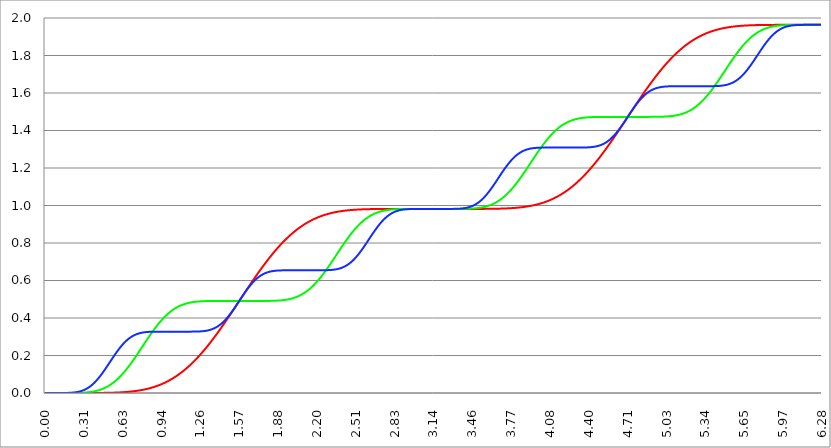
| Category | Series 1 | Series 0 | Series 2 |
|---|---|---|---|
| 0.0 | 0 | 0 | 0 |
| 0.00314159265358979 | 0 | 0 | 0 |
| 0.00628318530717958 | 0 | 0 | 0 |
| 0.00942477796076938 | 0 | 0 | 0 |
| 0.0125663706143592 | 0 | 0 | 0 |
| 0.015707963267949 | 0 | 0 | 0 |
| 0.0188495559215388 | 0 | 0 | 0 |
| 0.0219911485751285 | 0 | 0 | 0 |
| 0.0251327412287183 | 0 | 0 | 0 |
| 0.0282743338823081 | 0 | 0 | 0 |
| 0.0314159265358979 | 0 | 0 | 0 |
| 0.0345575191894877 | 0 | 0 | 0 |
| 0.0376991118430775 | 0 | 0 | 0 |
| 0.0408407044966673 | 0 | 0 | 0 |
| 0.0439822971502571 | 0 | 0 | 0 |
| 0.0471238898038469 | 0 | 0 | 0 |
| 0.0502654824574367 | 0 | 0 | 0 |
| 0.0534070751110265 | 0 | 0 | 0 |
| 0.0565486677646163 | 0 | 0 | 0 |
| 0.059690260418206 | 0 | 0 | 0 |
| 0.0628318530717958 | 0 | 0 | 0 |
| 0.0659734457253856 | 0 | 0 | 0 |
| 0.0691150383789754 | 0 | 0 | 0 |
| 0.0722566310325652 | 0 | 0 | 0 |
| 0.075398223686155 | 0 | 0 | 0 |
| 0.0785398163397448 | 0 | 0 | 0 |
| 0.0816814089933346 | 0 | 0 | 0 |
| 0.0848230016469244 | 0 | 0 | 0 |
| 0.0879645943005142 | 0 | 0 | 0 |
| 0.091106186954104 | 0 | 0 | 0 |
| 0.0942477796076937 | 0 | 0 | 0 |
| 0.0973893722612835 | 0 | 0 | 0 |
| 0.100530964914873 | 0 | 0 | 0 |
| 0.103672557568463 | 0 | 0 | 0 |
| 0.106814150222053 | 0 | 0 | 0 |
| 0.109955742875643 | 0 | 0 | 0 |
| 0.113097335529233 | 0 | 0 | 0 |
| 0.116238928182822 | 0 | 0 | 0 |
| 0.119380520836412 | 0 | 0 | 0 |
| 0.122522113490002 | 0 | 0 | 0 |
| 0.125663706143592 | 0 | 0 | 0 |
| 0.128805298797181 | 0 | 0 | 0 |
| 0.131946891450771 | 0 | 0 | 0 |
| 0.135088484104361 | 0 | 0 | 0 |
| 0.138230076757951 | 0 | 0 | 0 |
| 0.141371669411541 | 0 | 0 | 0 |
| 0.14451326206513 | 0 | 0 | 0 |
| 0.14765485471872 | 0 | 0 | 0 |
| 0.15079644737231 | 0 | 0 | 0 |
| 0.1539380400259 | 0 | 0 | 0 |
| 0.15707963267949 | 0 | 0 | 0 |
| 0.160221225333079 | 0 | 0 | 0 |
| 0.163362817986669 | 0 | 0 | 0 |
| 0.166504410640259 | 0 | 0 | 0 |
| 0.169646003293849 | 0 | 0 | 0 |
| 0.172787595947439 | 0 | 0 | 0 |
| 0.175929188601028 | 0 | 0 | 0 |
| 0.179070781254618 | 0 | 0 | 0 |
| 0.182212373908208 | 0 | 0 | 0.001 |
| 0.185353966561798 | 0 | 0 | 0.001 |
| 0.188495559215388 | 0 | 0 | 0.001 |
| 0.191637151868977 | 0 | 0 | 0.001 |
| 0.194778744522567 | 0 | 0 | 0.001 |
| 0.197920337176157 | 0 | 0 | 0.001 |
| 0.201061929829747 | 0 | 0 | 0.001 |
| 0.204203522483336 | 0 | 0 | 0.001 |
| 0.207345115136926 | 0 | 0 | 0.001 |
| 0.210486707790516 | 0 | 0 | 0.001 |
| 0.213628300444106 | 0 | 0 | 0.002 |
| 0.216769893097696 | 0 | 0 | 0.002 |
| 0.219911485751285 | 0 | 0 | 0.002 |
| 0.223053078404875 | 0 | 0 | 0.002 |
| 0.226194671058465 | 0 | 0 | 0.002 |
| 0.229336263712055 | 0 | 0 | 0.002 |
| 0.232477856365645 | 0 | 0 | 0.003 |
| 0.235619449019234 | 0 | 0 | 0.003 |
| 0.238761041672824 | 0 | 0 | 0.003 |
| 0.241902634326414 | 0 | 0 | 0.003 |
| 0.245044226980004 | 0 | 0 | 0.004 |
| 0.248185819633594 | 0 | 0 | 0.004 |
| 0.251327412287183 | 0 | 0 | 0.004 |
| 0.254469004940773 | 0 | 0.001 | 0.005 |
| 0.257610597594363 | 0 | 0.001 | 0.005 |
| 0.260752190247953 | 0 | 0.001 | 0.005 |
| 0.263893782901543 | 0 | 0.001 | 0.006 |
| 0.267035375555132 | 0 | 0.001 | 0.006 |
| 0.270176968208722 | 0 | 0.001 | 0.007 |
| 0.273318560862312 | 0 | 0.001 | 0.007 |
| 0.276460153515902 | 0 | 0.001 | 0.008 |
| 0.279601746169492 | 0 | 0.001 | 0.008 |
| 0.282743338823082 | 0 | 0.001 | 0.009 |
| 0.285884931476671 | 0 | 0.001 | 0.009 |
| 0.289026524130261 | 0 | 0.001 | 0.01 |
| 0.292168116783851 | 0 | 0.001 | 0.01 |
| 0.295309709437441 | 0 | 0.001 | 0.011 |
| 0.298451302091031 | 0 | 0.001 | 0.012 |
| 0.30159289474462 | 0 | 0.002 | 0.012 |
| 0.30473448739821 | 0 | 0.002 | 0.013 |
| 0.3078760800518 | 0 | 0.002 | 0.014 |
| 0.31101767270539 | 0 | 0.002 | 0.015 |
| 0.31415926535898 | 0 | 0.002 | 0.016 |
| 0.31730085801257 | 0 | 0.002 | 0.017 |
| 0.320442450666159 | 0 | 0.002 | 0.018 |
| 0.323584043319749 | 0 | 0.002 | 0.019 |
| 0.326725635973339 | 0 | 0.003 | 0.02 |
| 0.329867228626929 | 0 | 0.003 | 0.021 |
| 0.333008821280519 | 0 | 0.003 | 0.022 |
| 0.336150413934108 | 0 | 0.003 | 0.023 |
| 0.339292006587698 | 0 | 0.003 | 0.024 |
| 0.342433599241288 | 0 | 0.004 | 0.025 |
| 0.345575191894878 | 0 | 0.004 | 0.026 |
| 0.348716784548468 | 0 | 0.004 | 0.028 |
| 0.351858377202058 | 0 | 0.004 | 0.029 |
| 0.354999969855647 | 0 | 0.004 | 0.03 |
| 0.358141562509237 | 0 | 0.005 | 0.032 |
| 0.361283155162827 | 0 | 0.005 | 0.033 |
| 0.364424747816417 | 0 | 0.005 | 0.035 |
| 0.367566340470007 | 0 | 0.005 | 0.036 |
| 0.370707933123597 | 0 | 0.006 | 0.038 |
| 0.373849525777186 | 0 | 0.006 | 0.04 |
| 0.376991118430776 | 0 | 0.006 | 0.041 |
| 0.380132711084366 | 0 | 0.007 | 0.043 |
| 0.383274303737956 | 0 | 0.007 | 0.045 |
| 0.386415896391546 | 0 | 0.007 | 0.047 |
| 0.389557489045135 | 0 | 0.008 | 0.049 |
| 0.392699081698725 | 0 | 0.008 | 0.051 |
| 0.395840674352315 | 0 | 0.009 | 0.053 |
| 0.398982267005905 | 0 | 0.009 | 0.055 |
| 0.402123859659495 | 0 | 0.009 | 0.057 |
| 0.405265452313085 | 0 | 0.01 | 0.059 |
| 0.408407044966674 | 0 | 0.01 | 0.061 |
| 0.411548637620264 | 0 | 0.011 | 0.063 |
| 0.414690230273854 | 0 | 0.011 | 0.065 |
| 0.417831822927444 | 0 | 0.012 | 0.068 |
| 0.420973415581034 | 0 | 0.012 | 0.07 |
| 0.424115008234623 | 0 | 0.013 | 0.072 |
| 0.427256600888213 | 0 | 0.013 | 0.075 |
| 0.430398193541803 | 0 | 0.014 | 0.077 |
| 0.433539786195393 | 0 | 0.015 | 0.08 |
| 0.436681378848983 | 0 | 0.015 | 0.082 |
| 0.439822971502573 | 0 | 0.016 | 0.085 |
| 0.442964564156162 | 0 | 0.017 | 0.087 |
| 0.446106156809752 | 0 | 0.017 | 0.09 |
| 0.449247749463342 | 0 | 0.018 | 0.093 |
| 0.452389342116932 | 0 | 0.019 | 0.096 |
| 0.455530934770522 | 0 | 0.019 | 0.098 |
| 0.458672527424111 | 0.001 | 0.02 | 0.101 |
| 0.461814120077701 | 0.001 | 0.021 | 0.104 |
| 0.464955712731291 | 0.001 | 0.022 | 0.107 |
| 0.468097305384881 | 0.001 | 0.023 | 0.11 |
| 0.471238898038471 | 0.001 | 0.024 | 0.113 |
| 0.474380490692061 | 0.001 | 0.024 | 0.115 |
| 0.47752208334565 | 0.001 | 0.025 | 0.118 |
| 0.48066367599924 | 0.001 | 0.026 | 0.121 |
| 0.48380526865283 | 0.001 | 0.027 | 0.124 |
| 0.48694686130642 | 0.001 | 0.028 | 0.127 |
| 0.49008845396001 | 0.001 | 0.029 | 0.13 |
| 0.493230046613599 | 0.001 | 0.03 | 0.134 |
| 0.496371639267189 | 0.001 | 0.031 | 0.137 |
| 0.499513231920779 | 0.001 | 0.033 | 0.14 |
| 0.502654824574369 | 0.001 | 0.034 | 0.143 |
| 0.505796417227959 | 0.001 | 0.035 | 0.146 |
| 0.508938009881549 | 0.001 | 0.036 | 0.149 |
| 0.512079602535138 | 0.001 | 0.037 | 0.152 |
| 0.515221195188728 | 0.001 | 0.038 | 0.155 |
| 0.518362787842318 | 0.001 | 0.04 | 0.158 |
| 0.521504380495908 | 0.001 | 0.041 | 0.162 |
| 0.524645973149498 | 0.001 | 0.042 | 0.165 |
| 0.527787565803087 | 0.001 | 0.044 | 0.168 |
| 0.530929158456677 | 0.001 | 0.045 | 0.171 |
| 0.534070751110267 | 0.001 | 0.046 | 0.174 |
| 0.537212343763857 | 0.001 | 0.048 | 0.177 |
| 0.540353936417447 | 0.002 | 0.049 | 0.18 |
| 0.543495529071037 | 0.002 | 0.051 | 0.183 |
| 0.546637121724626 | 0.002 | 0.052 | 0.187 |
| 0.549778714378216 | 0.002 | 0.054 | 0.19 |
| 0.552920307031806 | 0.002 | 0.055 | 0.193 |
| 0.556061899685396 | 0.002 | 0.057 | 0.196 |
| 0.559203492338986 | 0.002 | 0.059 | 0.199 |
| 0.562345084992576 | 0.002 | 0.06 | 0.202 |
| 0.565486677646165 | 0.002 | 0.062 | 0.205 |
| 0.568628270299755 | 0.002 | 0.064 | 0.208 |
| 0.571769862953345 | 0.002 | 0.066 | 0.211 |
| 0.574911455606935 | 0.002 | 0.067 | 0.214 |
| 0.578053048260525 | 0.002 | 0.069 | 0.217 |
| 0.581194640914114 | 0.002 | 0.071 | 0.22 |
| 0.584336233567704 | 0.003 | 0.073 | 0.222 |
| 0.587477826221294 | 0.003 | 0.075 | 0.225 |
| 0.590619418874884 | 0.003 | 0.077 | 0.228 |
| 0.593761011528474 | 0.003 | 0.079 | 0.231 |
| 0.596902604182064 | 0.003 | 0.081 | 0.234 |
| 0.600044196835653 | 0.003 | 0.083 | 0.236 |
| 0.603185789489243 | 0.003 | 0.085 | 0.239 |
| 0.606327382142833 | 0.003 | 0.087 | 0.242 |
| 0.609468974796423 | 0.003 | 0.089 | 0.244 |
| 0.612610567450013 | 0.003 | 0.091 | 0.247 |
| 0.615752160103602 | 0.004 | 0.094 | 0.249 |
| 0.618893752757192 | 0.004 | 0.096 | 0.252 |
| 0.622035345410782 | 0.004 | 0.098 | 0.254 |
| 0.625176938064372 | 0.004 | 0.1 | 0.256 |
| 0.628318530717962 | 0.004 | 0.103 | 0.259 |
| 0.631460123371551 | 0.004 | 0.105 | 0.261 |
| 0.634601716025141 | 0.004 | 0.107 | 0.263 |
| 0.637743308678731 | 0.004 | 0.11 | 0.266 |
| 0.640884901332321 | 0.005 | 0.112 | 0.268 |
| 0.644026493985911 | 0.005 | 0.115 | 0.27 |
| 0.647168086639501 | 0.005 | 0.117 | 0.272 |
| 0.65030967929309 | 0.005 | 0.12 | 0.274 |
| 0.65345127194668 | 0.005 | 0.122 | 0.276 |
| 0.65659286460027 | 0.005 | 0.125 | 0.278 |
| 0.65973445725386 | 0.006 | 0.127 | 0.28 |
| 0.66287604990745 | 0.006 | 0.13 | 0.282 |
| 0.666017642561039 | 0.006 | 0.133 | 0.283 |
| 0.669159235214629 | 0.006 | 0.135 | 0.285 |
| 0.672300827868219 | 0.006 | 0.138 | 0.287 |
| 0.675442420521809 | 0.006 | 0.141 | 0.289 |
| 0.678584013175399 | 0.007 | 0.143 | 0.29 |
| 0.681725605828989 | 0.007 | 0.146 | 0.292 |
| 0.684867198482578 | 0.007 | 0.149 | 0.293 |
| 0.688008791136168 | 0.007 | 0.152 | 0.295 |
| 0.691150383789758 | 0.007 | 0.154 | 0.296 |
| 0.694291976443348 | 0.008 | 0.157 | 0.298 |
| 0.697433569096938 | 0.008 | 0.16 | 0.299 |
| 0.700575161750528 | 0.008 | 0.163 | 0.3 |
| 0.703716754404117 | 0.008 | 0.166 | 0.302 |
| 0.706858347057707 | 0.009 | 0.169 | 0.303 |
| 0.709999939711297 | 0.009 | 0.172 | 0.304 |
| 0.713141532364887 | 0.009 | 0.175 | 0.305 |
| 0.716283125018477 | 0.009 | 0.178 | 0.306 |
| 0.719424717672066 | 0.01 | 0.181 | 0.307 |
| 0.722566310325656 | 0.01 | 0.184 | 0.308 |
| 0.725707902979246 | 0.01 | 0.187 | 0.309 |
| 0.728849495632836 | 0.01 | 0.19 | 0.31 |
| 0.731991088286426 | 0.011 | 0.193 | 0.311 |
| 0.735132680940016 | 0.011 | 0.196 | 0.312 |
| 0.738274273593605 | 0.011 | 0.199 | 0.313 |
| 0.741415866247195 | 0.011 | 0.202 | 0.314 |
| 0.744557458900785 | 0.012 | 0.205 | 0.315 |
| 0.747699051554375 | 0.012 | 0.208 | 0.315 |
| 0.750840644207965 | 0.012 | 0.211 | 0.316 |
| 0.753982236861554 | 0.013 | 0.214 | 0.317 |
| 0.757123829515144 | 0.013 | 0.217 | 0.317 |
| 0.760265422168734 | 0.013 | 0.22 | 0.318 |
| 0.763407014822324 | 0.014 | 0.223 | 0.318 |
| 0.766548607475914 | 0.014 | 0.227 | 0.319 |
| 0.769690200129504 | 0.014 | 0.23 | 0.32 |
| 0.772831792783093 | 0.015 | 0.233 | 0.32 |
| 0.775973385436683 | 0.015 | 0.236 | 0.321 |
| 0.779114978090273 | 0.015 | 0.239 | 0.321 |
| 0.782256570743863 | 0.016 | 0.242 | 0.321 |
| 0.785398163397453 | 0.016 | 0.245 | 0.322 |
| 0.788539756051042 | 0.017 | 0.249 | 0.322 |
| 0.791681348704632 | 0.017 | 0.252 | 0.323 |
| 0.794822941358222 | 0.017 | 0.255 | 0.323 |
| 0.797964534011812 | 0.018 | 0.258 | 0.323 |
| 0.801106126665402 | 0.018 | 0.261 | 0.324 |
| 0.804247719318992 | 0.019 | 0.264 | 0.324 |
| 0.807389311972581 | 0.019 | 0.267 | 0.324 |
| 0.810530904626171 | 0.02 | 0.271 | 0.324 |
| 0.813672497279761 | 0.02 | 0.274 | 0.325 |
| 0.816814089933351 | 0.021 | 0.277 | 0.325 |
| 0.819955682586941 | 0.021 | 0.28 | 0.325 |
| 0.823097275240531 | 0.022 | 0.283 | 0.325 |
| 0.82623886789412 | 0.022 | 0.286 | 0.325 |
| 0.82938046054771 | 0.023 | 0.289 | 0.326 |
| 0.8325220532013 | 0.023 | 0.292 | 0.326 |
| 0.83566364585489 | 0.024 | 0.295 | 0.326 |
| 0.83880523850848 | 0.024 | 0.298 | 0.326 |
| 0.841946831162069 | 0.025 | 0.301 | 0.326 |
| 0.845088423815659 | 0.025 | 0.304 | 0.326 |
| 0.848230016469249 | 0.026 | 0.307 | 0.326 |
| 0.851371609122839 | 0.026 | 0.31 | 0.326 |
| 0.854513201776429 | 0.027 | 0.313 | 0.326 |
| 0.857654794430019 | 0.027 | 0.316 | 0.327 |
| 0.860796387083608 | 0.028 | 0.319 | 0.327 |
| 0.863937979737198 | 0.029 | 0.322 | 0.327 |
| 0.867079572390788 | 0.029 | 0.325 | 0.327 |
| 0.870221165044378 | 0.03 | 0.328 | 0.327 |
| 0.873362757697968 | 0.031 | 0.331 | 0.327 |
| 0.876504350351557 | 0.031 | 0.334 | 0.327 |
| 0.879645943005147 | 0.032 | 0.336 | 0.327 |
| 0.882787535658737 | 0.032 | 0.339 | 0.327 |
| 0.885929128312327 | 0.033 | 0.342 | 0.327 |
| 0.889070720965917 | 0.034 | 0.345 | 0.327 |
| 0.892212313619507 | 0.035 | 0.348 | 0.327 |
| 0.895353906273096 | 0.035 | 0.35 | 0.327 |
| 0.898495498926686 | 0.036 | 0.353 | 0.327 |
| 0.901637091580276 | 0.037 | 0.356 | 0.327 |
| 0.904778684233866 | 0.037 | 0.358 | 0.327 |
| 0.907920276887456 | 0.038 | 0.361 | 0.327 |
| 0.911061869541045 | 0.039 | 0.364 | 0.327 |
| 0.914203462194635 | 0.04 | 0.366 | 0.327 |
| 0.917345054848225 | 0.04 | 0.369 | 0.327 |
| 0.920486647501815 | 0.041 | 0.371 | 0.327 |
| 0.923628240155405 | 0.042 | 0.374 | 0.327 |
| 0.926769832808995 | 0.043 | 0.376 | 0.327 |
| 0.929911425462584 | 0.044 | 0.379 | 0.327 |
| 0.933053018116174 | 0.045 | 0.381 | 0.327 |
| 0.936194610769764 | 0.045 | 0.383 | 0.327 |
| 0.939336203423354 | 0.046 | 0.386 | 0.327 |
| 0.942477796076944 | 0.047 | 0.388 | 0.327 |
| 0.945619388730533 | 0.048 | 0.39 | 0.327 |
| 0.948760981384123 | 0.049 | 0.393 | 0.327 |
| 0.951902574037713 | 0.05 | 0.395 | 0.327 |
| 0.955044166691303 | 0.051 | 0.397 | 0.327 |
| 0.958185759344893 | 0.052 | 0.399 | 0.327 |
| 0.961327351998483 | 0.053 | 0.402 | 0.327 |
| 0.964468944652072 | 0.054 | 0.404 | 0.327 |
| 0.967610537305662 | 0.055 | 0.406 | 0.327 |
| 0.970752129959252 | 0.056 | 0.408 | 0.327 |
| 0.973893722612842 | 0.057 | 0.41 | 0.327 |
| 0.977035315266432 | 0.058 | 0.412 | 0.327 |
| 0.980176907920022 | 0.059 | 0.414 | 0.327 |
| 0.983318500573611 | 0.06 | 0.416 | 0.327 |
| 0.986460093227201 | 0.061 | 0.418 | 0.327 |
| 0.989601685880791 | 0.062 | 0.42 | 0.327 |
| 0.992743278534381 | 0.063 | 0.422 | 0.327 |
| 0.995884871187971 | 0.064 | 0.423 | 0.327 |
| 0.99902646384156 | 0.065 | 0.425 | 0.327 |
| 1.00216805649515 | 0.066 | 0.427 | 0.327 |
| 1.00530964914874 | 0.067 | 0.429 | 0.327 |
| 1.00845124180233 | 0.068 | 0.43 | 0.327 |
| 1.01159283445592 | 0.07 | 0.432 | 0.327 |
| 1.01473442710951 | 0.071 | 0.434 | 0.327 |
| 1.017876019763099 | 0.072 | 0.435 | 0.327 |
| 1.021017612416689 | 0.073 | 0.437 | 0.327 |
| 1.02415920507028 | 0.074 | 0.439 | 0.327 |
| 1.027300797723869 | 0.076 | 0.44 | 0.327 |
| 1.030442390377459 | 0.077 | 0.442 | 0.327 |
| 1.033583983031048 | 0.078 | 0.443 | 0.327 |
| 1.036725575684638 | 0.079 | 0.444 | 0.327 |
| 1.039867168338228 | 0.081 | 0.446 | 0.327 |
| 1.043008760991818 | 0.082 | 0.447 | 0.327 |
| 1.046150353645408 | 0.083 | 0.449 | 0.327 |
| 1.049291946298998 | 0.085 | 0.45 | 0.327 |
| 1.052433538952587 | 0.086 | 0.451 | 0.327 |
| 1.055575131606177 | 0.087 | 0.452 | 0.327 |
| 1.058716724259767 | 0.089 | 0.454 | 0.327 |
| 1.061858316913357 | 0.09 | 0.455 | 0.327 |
| 1.064999909566947 | 0.091 | 0.456 | 0.327 |
| 1.068141502220536 | 0.093 | 0.457 | 0.327 |
| 1.071283094874126 | 0.094 | 0.458 | 0.327 |
| 1.074424687527716 | 0.096 | 0.459 | 0.327 |
| 1.077566280181306 | 0.097 | 0.461 | 0.327 |
| 1.080707872834896 | 0.099 | 0.462 | 0.327 |
| 1.083849465488486 | 0.1 | 0.463 | 0.327 |
| 1.086991058142075 | 0.102 | 0.464 | 0.327 |
| 1.090132650795665 | 0.103 | 0.465 | 0.327 |
| 1.093274243449255 | 0.105 | 0.465 | 0.327 |
| 1.096415836102845 | 0.106 | 0.466 | 0.327 |
| 1.099557428756435 | 0.108 | 0.467 | 0.327 |
| 1.102699021410025 | 0.109 | 0.468 | 0.327 |
| 1.105840614063614 | 0.111 | 0.469 | 0.327 |
| 1.108982206717204 | 0.113 | 0.47 | 0.327 |
| 1.112123799370794 | 0.114 | 0.471 | 0.327 |
| 1.115265392024384 | 0.116 | 0.471 | 0.327 |
| 1.118406984677974 | 0.118 | 0.472 | 0.327 |
| 1.121548577331563 | 0.119 | 0.473 | 0.327 |
| 1.124690169985153 | 0.121 | 0.474 | 0.327 |
| 1.127831762638743 | 0.123 | 0.474 | 0.327 |
| 1.130973355292333 | 0.124 | 0.475 | 0.327 |
| 1.134114947945923 | 0.126 | 0.476 | 0.327 |
| 1.137256540599513 | 0.128 | 0.476 | 0.327 |
| 1.140398133253102 | 0.13 | 0.477 | 0.327 |
| 1.143539725906692 | 0.131 | 0.477 | 0.327 |
| 1.146681318560282 | 0.133 | 0.478 | 0.327 |
| 1.149822911213872 | 0.135 | 0.479 | 0.327 |
| 1.152964503867462 | 0.137 | 0.479 | 0.327 |
| 1.156106096521051 | 0.139 | 0.48 | 0.327 |
| 1.159247689174641 | 0.14 | 0.48 | 0.327 |
| 1.162389281828231 | 0.142 | 0.481 | 0.327 |
| 1.165530874481821 | 0.144 | 0.481 | 0.327 |
| 1.168672467135411 | 0.146 | 0.481 | 0.327 |
| 1.171814059789001 | 0.148 | 0.482 | 0.327 |
| 1.17495565244259 | 0.15 | 0.482 | 0.327 |
| 1.17809724509618 | 0.152 | 0.483 | 0.327 |
| 1.18123883774977 | 0.154 | 0.483 | 0.327 |
| 1.18438043040336 | 0.156 | 0.483 | 0.327 |
| 1.18752202305695 | 0.158 | 0.484 | 0.327 |
| 1.190663615710539 | 0.16 | 0.484 | 0.327 |
| 1.193805208364129 | 0.162 | 0.485 | 0.327 |
| 1.19694680101772 | 0.164 | 0.485 | 0.327 |
| 1.200088393671309 | 0.166 | 0.485 | 0.327 |
| 1.203229986324899 | 0.168 | 0.485 | 0.327 |
| 1.206371578978489 | 0.17 | 0.486 | 0.327 |
| 1.209513171632078 | 0.172 | 0.486 | 0.328 |
| 1.212654764285668 | 0.174 | 0.486 | 0.328 |
| 1.215796356939258 | 0.176 | 0.486 | 0.328 |
| 1.218937949592848 | 0.179 | 0.487 | 0.328 |
| 1.222079542246438 | 0.181 | 0.487 | 0.328 |
| 1.225221134900027 | 0.183 | 0.487 | 0.328 |
| 1.228362727553617 | 0.185 | 0.487 | 0.328 |
| 1.231504320207207 | 0.187 | 0.488 | 0.328 |
| 1.234645912860797 | 0.189 | 0.488 | 0.328 |
| 1.237787505514387 | 0.192 | 0.488 | 0.328 |
| 1.240929098167977 | 0.194 | 0.488 | 0.328 |
| 1.244070690821566 | 0.196 | 0.488 | 0.328 |
| 1.247212283475156 | 0.198 | 0.488 | 0.328 |
| 1.250353876128746 | 0.201 | 0.489 | 0.328 |
| 1.253495468782336 | 0.203 | 0.489 | 0.328 |
| 1.256637061435926 | 0.205 | 0.489 | 0.329 |
| 1.259778654089515 | 0.208 | 0.489 | 0.329 |
| 1.262920246743105 | 0.21 | 0.489 | 0.329 |
| 1.266061839396695 | 0.212 | 0.489 | 0.329 |
| 1.269203432050285 | 0.215 | 0.489 | 0.329 |
| 1.272345024703875 | 0.217 | 0.489 | 0.329 |
| 1.275486617357465 | 0.22 | 0.49 | 0.33 |
| 1.278628210011054 | 0.222 | 0.49 | 0.33 |
| 1.281769802664644 | 0.224 | 0.49 | 0.33 |
| 1.284911395318234 | 0.227 | 0.49 | 0.33 |
| 1.288052987971824 | 0.229 | 0.49 | 0.331 |
| 1.291194580625414 | 0.232 | 0.49 | 0.331 |
| 1.294336173279003 | 0.234 | 0.49 | 0.331 |
| 1.297477765932593 | 0.237 | 0.49 | 0.331 |
| 1.300619358586183 | 0.239 | 0.49 | 0.332 |
| 1.303760951239773 | 0.242 | 0.49 | 0.332 |
| 1.306902543893363 | 0.244 | 0.49 | 0.332 |
| 1.310044136546953 | 0.247 | 0.49 | 0.333 |
| 1.313185729200542 | 0.249 | 0.49 | 0.333 |
| 1.316327321854132 | 0.252 | 0.49 | 0.334 |
| 1.319468914507722 | 0.255 | 0.49 | 0.334 |
| 1.322610507161312 | 0.257 | 0.49 | 0.335 |
| 1.325752099814902 | 0.26 | 0.49 | 0.335 |
| 1.328893692468491 | 0.262 | 0.491 | 0.336 |
| 1.332035285122081 | 0.265 | 0.491 | 0.336 |
| 1.335176877775671 | 0.268 | 0.491 | 0.337 |
| 1.338318470429261 | 0.27 | 0.491 | 0.337 |
| 1.341460063082851 | 0.273 | 0.491 | 0.338 |
| 1.344601655736441 | 0.276 | 0.491 | 0.339 |
| 1.34774324839003 | 0.278 | 0.491 | 0.339 |
| 1.35088484104362 | 0.281 | 0.491 | 0.34 |
| 1.35402643369721 | 0.284 | 0.491 | 0.341 |
| 1.3571680263508 | 0.287 | 0.491 | 0.342 |
| 1.36030961900439 | 0.289 | 0.491 | 0.343 |
| 1.363451211657979 | 0.292 | 0.491 | 0.344 |
| 1.36659280431157 | 0.295 | 0.491 | 0.344 |
| 1.369734396965159 | 0.298 | 0.491 | 0.345 |
| 1.372875989618749 | 0.3 | 0.491 | 0.346 |
| 1.376017582272339 | 0.303 | 0.491 | 0.347 |
| 1.379159174925929 | 0.306 | 0.491 | 0.349 |
| 1.382300767579518 | 0.309 | 0.491 | 0.35 |
| 1.385442360233108 | 0.312 | 0.491 | 0.351 |
| 1.388583952886698 | 0.315 | 0.491 | 0.352 |
| 1.391725545540288 | 0.317 | 0.491 | 0.353 |
| 1.394867138193878 | 0.32 | 0.491 | 0.355 |
| 1.398008730847468 | 0.323 | 0.491 | 0.356 |
| 1.401150323501057 | 0.326 | 0.491 | 0.357 |
| 1.404291916154647 | 0.329 | 0.491 | 0.359 |
| 1.407433508808237 | 0.332 | 0.491 | 0.36 |
| 1.410575101461827 | 0.335 | 0.491 | 0.362 |
| 1.413716694115417 | 0.338 | 0.491 | 0.363 |
| 1.416858286769006 | 0.341 | 0.491 | 0.365 |
| 1.419999879422596 | 0.343 | 0.491 | 0.366 |
| 1.423141472076186 | 0.346 | 0.491 | 0.368 |
| 1.426283064729776 | 0.349 | 0.491 | 0.37 |
| 1.429424657383366 | 0.352 | 0.491 | 0.372 |
| 1.432566250036956 | 0.355 | 0.491 | 0.373 |
| 1.435707842690545 | 0.358 | 0.491 | 0.375 |
| 1.438849435344135 | 0.361 | 0.491 | 0.377 |
| 1.441991027997725 | 0.364 | 0.491 | 0.379 |
| 1.445132620651315 | 0.367 | 0.491 | 0.381 |
| 1.448274213304905 | 0.37 | 0.491 | 0.383 |
| 1.451415805958494 | 0.373 | 0.491 | 0.385 |
| 1.454557398612084 | 0.376 | 0.491 | 0.387 |
| 1.457698991265674 | 0.379 | 0.491 | 0.39 |
| 1.460840583919264 | 0.382 | 0.491 | 0.392 |
| 1.463982176572854 | 0.385 | 0.491 | 0.394 |
| 1.467123769226444 | 0.388 | 0.491 | 0.396 |
| 1.470265361880033 | 0.391 | 0.491 | 0.399 |
| 1.473406954533623 | 0.394 | 0.491 | 0.401 |
| 1.476548547187213 | 0.397 | 0.491 | 0.404 |
| 1.479690139840803 | 0.401 | 0.491 | 0.406 |
| 1.482831732494393 | 0.404 | 0.491 | 0.409 |
| 1.485973325147982 | 0.407 | 0.491 | 0.411 |
| 1.489114917801572 | 0.41 | 0.491 | 0.414 |
| 1.492256510455162 | 0.413 | 0.491 | 0.417 |
| 1.495398103108752 | 0.416 | 0.491 | 0.419 |
| 1.498539695762342 | 0.419 | 0.491 | 0.422 |
| 1.501681288415932 | 0.422 | 0.491 | 0.425 |
| 1.504822881069521 | 0.425 | 0.491 | 0.427 |
| 1.507964473723111 | 0.428 | 0.491 | 0.43 |
| 1.511106066376701 | 0.431 | 0.491 | 0.433 |
| 1.514247659030291 | 0.435 | 0.491 | 0.436 |
| 1.517389251683881 | 0.438 | 0.491 | 0.439 |
| 1.520530844337471 | 0.441 | 0.491 | 0.442 |
| 1.52367243699106 | 0.444 | 0.491 | 0.445 |
| 1.52681402964465 | 0.447 | 0.491 | 0.448 |
| 1.52995562229824 | 0.45 | 0.491 | 0.451 |
| 1.53309721495183 | 0.453 | 0.491 | 0.454 |
| 1.53623880760542 | 0.456 | 0.491 | 0.457 |
| 1.539380400259009 | 0.459 | 0.491 | 0.46 |
| 1.542521992912599 | 0.463 | 0.491 | 0.463 |
| 1.545663585566189 | 0.466 | 0.491 | 0.466 |
| 1.548805178219779 | 0.469 | 0.491 | 0.469 |
| 1.551946770873369 | 0.472 | 0.491 | 0.472 |
| 1.555088363526959 | 0.475 | 0.491 | 0.475 |
| 1.558229956180548 | 0.478 | 0.491 | 0.478 |
| 1.561371548834138 | 0.481 | 0.491 | 0.481 |
| 1.564513141487728 | 0.485 | 0.491 | 0.485 |
| 1.567654734141318 | 0.488 | 0.491 | 0.488 |
| 1.570796326794908 | 0.491 | 0.491 | 0.491 |
| 1.573937919448497 | 0.494 | 0.491 | 0.494 |
| 1.577079512102087 | 0.497 | 0.491 | 0.497 |
| 1.580221104755677 | 0.5 | 0.491 | 0.5 |
| 1.583362697409267 | 0.503 | 0.491 | 0.503 |
| 1.586504290062857 | 0.507 | 0.491 | 0.507 |
| 1.589645882716447 | 0.51 | 0.491 | 0.51 |
| 1.592787475370036 | 0.513 | 0.491 | 0.513 |
| 1.595929068023626 | 0.516 | 0.491 | 0.516 |
| 1.599070660677216 | 0.519 | 0.491 | 0.519 |
| 1.602212253330806 | 0.522 | 0.491 | 0.522 |
| 1.605353845984396 | 0.525 | 0.491 | 0.525 |
| 1.608495438637985 | 0.529 | 0.491 | 0.528 |
| 1.611637031291575 | 0.532 | 0.491 | 0.531 |
| 1.614778623945165 | 0.535 | 0.491 | 0.534 |
| 1.617920216598755 | 0.538 | 0.491 | 0.537 |
| 1.621061809252345 | 0.541 | 0.491 | 0.54 |
| 1.624203401905935 | 0.544 | 0.491 | 0.543 |
| 1.627344994559524 | 0.547 | 0.491 | 0.546 |
| 1.630486587213114 | 0.55 | 0.491 | 0.549 |
| 1.633628179866704 | 0.553 | 0.491 | 0.552 |
| 1.636769772520294 | 0.557 | 0.491 | 0.554 |
| 1.639911365173884 | 0.56 | 0.491 | 0.557 |
| 1.643052957827473 | 0.563 | 0.491 | 0.56 |
| 1.646194550481063 | 0.566 | 0.491 | 0.563 |
| 1.649336143134653 | 0.569 | 0.491 | 0.565 |
| 1.652477735788243 | 0.572 | 0.491 | 0.568 |
| 1.655619328441833 | 0.575 | 0.491 | 0.57 |
| 1.658760921095423 | 0.578 | 0.491 | 0.573 |
| 1.661902513749012 | 0.581 | 0.491 | 0.576 |
| 1.665044106402602 | 0.584 | 0.491 | 0.578 |
| 1.668185699056192 | 0.587 | 0.491 | 0.58 |
| 1.671327291709782 | 0.59 | 0.491 | 0.583 |
| 1.674468884363372 | 0.593 | 0.491 | 0.585 |
| 1.677610477016961 | 0.596 | 0.491 | 0.588 |
| 1.680752069670551 | 0.6 | 0.491 | 0.59 |
| 1.683893662324141 | 0.603 | 0.491 | 0.592 |
| 1.687035254977731 | 0.606 | 0.491 | 0.594 |
| 1.690176847631321 | 0.609 | 0.491 | 0.596 |
| 1.693318440284911 | 0.612 | 0.491 | 0.599 |
| 1.6964600329385 | 0.615 | 0.491 | 0.601 |
| 1.69960162559209 | 0.618 | 0.491 | 0.603 |
| 1.70274321824568 | 0.621 | 0.491 | 0.605 |
| 1.70588481089927 | 0.624 | 0.491 | 0.606 |
| 1.70902640355286 | 0.627 | 0.491 | 0.608 |
| 1.712167996206449 | 0.629 | 0.491 | 0.61 |
| 1.715309588860039 | 0.632 | 0.491 | 0.612 |
| 1.71845118151363 | 0.635 | 0.491 | 0.614 |
| 1.721592774167219 | 0.638 | 0.491 | 0.615 |
| 1.724734366820809 | 0.641 | 0.491 | 0.617 |
| 1.727875959474399 | 0.644 | 0.491 | 0.619 |
| 1.731017552127988 | 0.647 | 0.491 | 0.62 |
| 1.734159144781578 | 0.65 | 0.491 | 0.622 |
| 1.737300737435168 | 0.653 | 0.491 | 0.623 |
| 1.740442330088758 | 0.656 | 0.491 | 0.624 |
| 1.743583922742348 | 0.659 | 0.491 | 0.626 |
| 1.746725515395937 | 0.661 | 0.491 | 0.627 |
| 1.749867108049527 | 0.664 | 0.491 | 0.628 |
| 1.753008700703117 | 0.667 | 0.491 | 0.63 |
| 1.756150293356707 | 0.67 | 0.491 | 0.631 |
| 1.759291886010297 | 0.673 | 0.491 | 0.632 |
| 1.762433478663887 | 0.676 | 0.491 | 0.633 |
| 1.765575071317476 | 0.678 | 0.491 | 0.634 |
| 1.768716663971066 | 0.681 | 0.491 | 0.635 |
| 1.771858256624656 | 0.684 | 0.491 | 0.636 |
| 1.774999849278246 | 0.687 | 0.491 | 0.637 |
| 1.778141441931836 | 0.69 | 0.491 | 0.638 |
| 1.781283034585426 | 0.692 | 0.491 | 0.639 |
| 1.784424627239015 | 0.695 | 0.491 | 0.64 |
| 1.787566219892605 | 0.698 | 0.491 | 0.641 |
| 1.790707812546195 | 0.701 | 0.491 | 0.642 |
| 1.793849405199785 | 0.703 | 0.491 | 0.642 |
| 1.796990997853375 | 0.706 | 0.491 | 0.643 |
| 1.800132590506964 | 0.709 | 0.491 | 0.644 |
| 1.803274183160554 | 0.711 | 0.491 | 0.644 |
| 1.806415775814144 | 0.714 | 0.491 | 0.645 |
| 1.809557368467734 | 0.717 | 0.491 | 0.646 |
| 1.812698961121324 | 0.719 | 0.491 | 0.646 |
| 1.815840553774914 | 0.722 | 0.491 | 0.647 |
| 1.818982146428503 | 0.725 | 0.491 | 0.647 |
| 1.822123739082093 | 0.727 | 0.491 | 0.648 |
| 1.825265331735683 | 0.73 | 0.491 | 0.648 |
| 1.828406924389273 | 0.732 | 0.491 | 0.649 |
| 1.831548517042863 | 0.735 | 0.491 | 0.649 |
| 1.834690109696452 | 0.737 | 0.492 | 0.649 |
| 1.837831702350042 | 0.74 | 0.492 | 0.65 |
| 1.840973295003632 | 0.742 | 0.492 | 0.65 |
| 1.844114887657222 | 0.745 | 0.492 | 0.65 |
| 1.847256480310812 | 0.747 | 0.492 | 0.651 |
| 1.850398072964402 | 0.75 | 0.492 | 0.651 |
| 1.853539665617991 | 0.752 | 0.492 | 0.651 |
| 1.856681258271581 | 0.755 | 0.492 | 0.651 |
| 1.859822850925171 | 0.757 | 0.492 | 0.652 |
| 1.862964443578761 | 0.76 | 0.492 | 0.652 |
| 1.866106036232351 | 0.762 | 0.492 | 0.652 |
| 1.86924762888594 | 0.765 | 0.492 | 0.652 |
| 1.87238922153953 | 0.767 | 0.492 | 0.653 |
| 1.87553081419312 | 0.769 | 0.493 | 0.653 |
| 1.87867240684671 | 0.772 | 0.493 | 0.653 |
| 1.8818139995003 | 0.774 | 0.493 | 0.653 |
| 1.88495559215389 | 0.776 | 0.493 | 0.653 |
| 1.888097184807479 | 0.779 | 0.493 | 0.653 |
| 1.891238777461069 | 0.781 | 0.493 | 0.653 |
| 1.89438037011466 | 0.783 | 0.493 | 0.653 |
| 1.897521962768249 | 0.786 | 0.493 | 0.654 |
| 1.900663555421839 | 0.788 | 0.494 | 0.654 |
| 1.903805148075429 | 0.79 | 0.494 | 0.654 |
| 1.906946740729018 | 0.792 | 0.494 | 0.654 |
| 1.910088333382608 | 0.794 | 0.494 | 0.654 |
| 1.913229926036198 | 0.797 | 0.494 | 0.654 |
| 1.916371518689788 | 0.799 | 0.495 | 0.654 |
| 1.919513111343378 | 0.801 | 0.495 | 0.654 |
| 1.922654703996967 | 0.803 | 0.495 | 0.654 |
| 1.925796296650557 | 0.805 | 0.495 | 0.654 |
| 1.928937889304147 | 0.807 | 0.496 | 0.654 |
| 1.932079481957737 | 0.81 | 0.496 | 0.654 |
| 1.935221074611327 | 0.812 | 0.496 | 0.654 |
| 1.938362667264917 | 0.814 | 0.496 | 0.654 |
| 1.941504259918506 | 0.816 | 0.497 | 0.654 |
| 1.944645852572096 | 0.818 | 0.497 | 0.654 |
| 1.947787445225686 | 0.82 | 0.497 | 0.654 |
| 1.950929037879276 | 0.822 | 0.498 | 0.654 |
| 1.954070630532866 | 0.824 | 0.498 | 0.654 |
| 1.957212223186455 | 0.826 | 0.498 | 0.654 |
| 1.960353815840045 | 0.828 | 0.499 | 0.654 |
| 1.963495408493635 | 0.83 | 0.499 | 0.654 |
| 1.966637001147225 | 0.832 | 0.499 | 0.654 |
| 1.969778593800815 | 0.834 | 0.5 | 0.654 |
| 1.972920186454405 | 0.836 | 0.5 | 0.654 |
| 1.976061779107994 | 0.838 | 0.501 | 0.654 |
| 1.979203371761584 | 0.839 | 0.501 | 0.654 |
| 1.982344964415174 | 0.841 | 0.502 | 0.654 |
| 1.985486557068764 | 0.843 | 0.502 | 0.654 |
| 1.988628149722354 | 0.845 | 0.503 | 0.654 |
| 1.991769742375943 | 0.847 | 0.503 | 0.654 |
| 1.994911335029533 | 0.849 | 0.504 | 0.654 |
| 1.998052927683123 | 0.85 | 0.504 | 0.654 |
| 2.001194520336712 | 0.852 | 0.505 | 0.654 |
| 2.004336112990302 | 0.854 | 0.506 | 0.654 |
| 2.007477705643892 | 0.856 | 0.506 | 0.654 |
| 2.010619298297482 | 0.857 | 0.507 | 0.654 |
| 2.013760890951071 | 0.859 | 0.507 | 0.654 |
| 2.016902483604661 | 0.861 | 0.508 | 0.654 |
| 2.02004407625825 | 0.863 | 0.509 | 0.654 |
| 2.02318566891184 | 0.864 | 0.51 | 0.654 |
| 2.02632726156543 | 0.866 | 0.51 | 0.654 |
| 2.029468854219019 | 0.868 | 0.511 | 0.654 |
| 2.032610446872609 | 0.869 | 0.512 | 0.654 |
| 2.035752039526198 | 0.871 | 0.513 | 0.654 |
| 2.038893632179788 | 0.872 | 0.514 | 0.654 |
| 2.042035224833378 | 0.874 | 0.514 | 0.654 |
| 2.045176817486967 | 0.876 | 0.515 | 0.654 |
| 2.048318410140557 | 0.877 | 0.516 | 0.654 |
| 2.051460002794146 | 0.879 | 0.517 | 0.654 |
| 2.054601595447736 | 0.88 | 0.518 | 0.654 |
| 2.057743188101325 | 0.882 | 0.519 | 0.654 |
| 2.060884780754915 | 0.883 | 0.52 | 0.654 |
| 2.064026373408505 | 0.885 | 0.521 | 0.654 |
| 2.067167966062094 | 0.886 | 0.522 | 0.654 |
| 2.070309558715684 | 0.887 | 0.523 | 0.654 |
| 2.073451151369273 | 0.889 | 0.525 | 0.654 |
| 2.076592744022863 | 0.89 | 0.526 | 0.654 |
| 2.079734336676452 | 0.892 | 0.527 | 0.654 |
| 2.082875929330042 | 0.893 | 0.528 | 0.654 |
| 2.086017521983632 | 0.894 | 0.529 | 0.654 |
| 2.089159114637221 | 0.896 | 0.531 | 0.654 |
| 2.092300707290811 | 0.897 | 0.532 | 0.654 |
| 2.095442299944401 | 0.899 | 0.533 | 0.654 |
| 2.09858389259799 | 0.9 | 0.535 | 0.654 |
| 2.10172548525158 | 0.901 | 0.536 | 0.654 |
| 2.104867077905169 | 0.902 | 0.537 | 0.654 |
| 2.108008670558759 | 0.904 | 0.539 | 0.654 |
| 2.111150263212349 | 0.905 | 0.54 | 0.654 |
| 2.114291855865938 | 0.906 | 0.542 | 0.654 |
| 2.117433448519528 | 0.907 | 0.543 | 0.654 |
| 2.120575041173117 | 0.909 | 0.545 | 0.654 |
| 2.123716633826707 | 0.91 | 0.546 | 0.654 |
| 2.126858226480297 | 0.911 | 0.548 | 0.654 |
| 2.129999819133886 | 0.912 | 0.55 | 0.654 |
| 2.133141411787476 | 0.913 | 0.551 | 0.654 |
| 2.136283004441065 | 0.914 | 0.553 | 0.654 |
| 2.139424597094655 | 0.916 | 0.555 | 0.654 |
| 2.142566189748245 | 0.917 | 0.557 | 0.654 |
| 2.145707782401834 | 0.918 | 0.558 | 0.654 |
| 2.148849375055424 | 0.919 | 0.56 | 0.654 |
| 2.151990967709013 | 0.92 | 0.562 | 0.654 |
| 2.155132560362603 | 0.921 | 0.564 | 0.654 |
| 2.158274153016193 | 0.922 | 0.566 | 0.654 |
| 2.161415745669782 | 0.923 | 0.568 | 0.654 |
| 2.164557338323372 | 0.924 | 0.57 | 0.654 |
| 2.167698930976961 | 0.925 | 0.572 | 0.654 |
| 2.170840523630551 | 0.926 | 0.574 | 0.654 |
| 2.173982116284141 | 0.927 | 0.576 | 0.655 |
| 2.17712370893773 | 0.928 | 0.578 | 0.655 |
| 2.18026530159132 | 0.929 | 0.58 | 0.655 |
| 2.183406894244909 | 0.93 | 0.582 | 0.655 |
| 2.186548486898499 | 0.931 | 0.585 | 0.655 |
| 2.189690079552089 | 0.932 | 0.587 | 0.655 |
| 2.192831672205678 | 0.933 | 0.589 | 0.655 |
| 2.195973264859268 | 0.934 | 0.591 | 0.655 |
| 2.199114857512857 | 0.935 | 0.594 | 0.655 |
| 2.202256450166447 | 0.935 | 0.596 | 0.655 |
| 2.205398042820036 | 0.936 | 0.598 | 0.655 |
| 2.208539635473626 | 0.937 | 0.601 | 0.655 |
| 2.211681228127216 | 0.938 | 0.603 | 0.655 |
| 2.214822820780805 | 0.939 | 0.606 | 0.655 |
| 2.217964413434395 | 0.94 | 0.608 | 0.655 |
| 2.221106006087984 | 0.94 | 0.611 | 0.655 |
| 2.224247598741574 | 0.941 | 0.613 | 0.655 |
| 2.227389191395164 | 0.942 | 0.616 | 0.655 |
| 2.230530784048753 | 0.943 | 0.618 | 0.655 |
| 2.233672376702343 | 0.944 | 0.621 | 0.655 |
| 2.236813969355933 | 0.944 | 0.623 | 0.655 |
| 2.239955562009522 | 0.945 | 0.626 | 0.655 |
| 2.243097154663112 | 0.946 | 0.629 | 0.655 |
| 2.246238747316701 | 0.947 | 0.631 | 0.655 |
| 2.249380339970291 | 0.947 | 0.634 | 0.655 |
| 2.252521932623881 | 0.948 | 0.637 | 0.655 |
| 2.25566352527747 | 0.949 | 0.64 | 0.655 |
| 2.25880511793106 | 0.949 | 0.643 | 0.655 |
| 2.261946710584649 | 0.95 | 0.645 | 0.655 |
| 2.265088303238239 | 0.951 | 0.648 | 0.655 |
| 2.268229895891829 | 0.951 | 0.651 | 0.655 |
| 2.271371488545418 | 0.952 | 0.654 | 0.655 |
| 2.274513081199008 | 0.952 | 0.657 | 0.655 |
| 2.277654673852597 | 0.953 | 0.66 | 0.655 |
| 2.280796266506186 | 0.954 | 0.663 | 0.655 |
| 2.283937859159776 | 0.954 | 0.666 | 0.655 |
| 2.287079451813366 | 0.955 | 0.668 | 0.655 |
| 2.290221044466955 | 0.955 | 0.671 | 0.655 |
| 2.293362637120545 | 0.956 | 0.674 | 0.655 |
| 2.296504229774135 | 0.957 | 0.677 | 0.656 |
| 2.299645822427724 | 0.957 | 0.68 | 0.656 |
| 2.302787415081314 | 0.958 | 0.684 | 0.656 |
| 2.305929007734904 | 0.958 | 0.687 | 0.656 |
| 2.309070600388493 | 0.959 | 0.69 | 0.656 |
| 2.312212193042083 | 0.959 | 0.693 | 0.656 |
| 2.315353785695672 | 0.96 | 0.696 | 0.656 |
| 2.318495378349262 | 0.96 | 0.699 | 0.657 |
| 2.321636971002852 | 0.961 | 0.702 | 0.657 |
| 2.324778563656441 | 0.961 | 0.705 | 0.657 |
| 2.327920156310031 | 0.962 | 0.708 | 0.657 |
| 2.33106174896362 | 0.962 | 0.711 | 0.657 |
| 2.33420334161721 | 0.963 | 0.714 | 0.658 |
| 2.3373449342708 | 0.963 | 0.717 | 0.658 |
| 2.340486526924389 | 0.963 | 0.721 | 0.658 |
| 2.343628119577979 | 0.964 | 0.724 | 0.659 |
| 2.346769712231568 | 0.964 | 0.727 | 0.659 |
| 2.349911304885158 | 0.965 | 0.73 | 0.659 |
| 2.353052897538748 | 0.965 | 0.733 | 0.66 |
| 2.356194490192337 | 0.965 | 0.736 | 0.66 |
| 2.359336082845927 | 0.966 | 0.739 | 0.66 |
| 2.362477675499516 | 0.966 | 0.743 | 0.661 |
| 2.365619268153106 | 0.967 | 0.746 | 0.661 |
| 2.368760860806696 | 0.967 | 0.749 | 0.662 |
| 2.371902453460285 | 0.967 | 0.752 | 0.662 |
| 2.375044046113875 | 0.968 | 0.755 | 0.663 |
| 2.378185638767464 | 0.968 | 0.758 | 0.663 |
| 2.381327231421054 | 0.968 | 0.761 | 0.664 |
| 2.384468824074644 | 0.969 | 0.764 | 0.664 |
| 2.387610416728233 | 0.969 | 0.768 | 0.665 |
| 2.390752009381823 | 0.969 | 0.771 | 0.666 |
| 2.393893602035412 | 0.97 | 0.774 | 0.666 |
| 2.397035194689002 | 0.97 | 0.777 | 0.667 |
| 2.400176787342591 | 0.97 | 0.78 | 0.668 |
| 2.403318379996181 | 0.971 | 0.783 | 0.669 |
| 2.406459972649771 | 0.971 | 0.786 | 0.67 |
| 2.40960156530336 | 0.971 | 0.789 | 0.671 |
| 2.41274315795695 | 0.971 | 0.792 | 0.671 |
| 2.41588475061054 | 0.972 | 0.795 | 0.672 |
| 2.419026343264129 | 0.972 | 0.798 | 0.673 |
| 2.422167935917719 | 0.972 | 0.801 | 0.674 |
| 2.425309528571308 | 0.972 | 0.804 | 0.675 |
| 2.428451121224898 | 0.973 | 0.807 | 0.677 |
| 2.431592713878488 | 0.973 | 0.81 | 0.678 |
| 2.434734306532077 | 0.973 | 0.813 | 0.679 |
| 2.437875899185667 | 0.973 | 0.816 | 0.68 |
| 2.441017491839256 | 0.974 | 0.819 | 0.681 |
| 2.444159084492846 | 0.974 | 0.822 | 0.683 |
| 2.447300677146435 | 0.974 | 0.824 | 0.684 |
| 2.450442269800025 | 0.974 | 0.827 | 0.685 |
| 2.453583862453615 | 0.975 | 0.83 | 0.687 |
| 2.456725455107204 | 0.975 | 0.833 | 0.688 |
| 2.459867047760794 | 0.975 | 0.836 | 0.69 |
| 2.463008640414384 | 0.975 | 0.838 | 0.691 |
| 2.466150233067973 | 0.975 | 0.841 | 0.693 |
| 2.469291825721563 | 0.976 | 0.844 | 0.695 |
| 2.472433418375152 | 0.976 | 0.847 | 0.697 |
| 2.475575011028742 | 0.976 | 0.849 | 0.698 |
| 2.478716603682332 | 0.976 | 0.852 | 0.7 |
| 2.481858196335921 | 0.976 | 0.854 | 0.702 |
| 2.48499978898951 | 0.976 | 0.857 | 0.704 |
| 2.4881413816431 | 0.977 | 0.86 | 0.706 |
| 2.49128297429669 | 0.977 | 0.862 | 0.708 |
| 2.49442456695028 | 0.977 | 0.865 | 0.71 |
| 2.497566159603869 | 0.977 | 0.867 | 0.712 |
| 2.500707752257458 | 0.977 | 0.87 | 0.714 |
| 2.503849344911048 | 0.977 | 0.872 | 0.716 |
| 2.506990937564638 | 0.977 | 0.874 | 0.718 |
| 2.510132530218228 | 0.978 | 0.877 | 0.721 |
| 2.513274122871817 | 0.978 | 0.879 | 0.723 |
| 2.516415715525407 | 0.978 | 0.881 | 0.725 |
| 2.519557308178996 | 0.978 | 0.884 | 0.728 |
| 2.522698900832586 | 0.978 | 0.886 | 0.73 |
| 2.525840493486176 | 0.978 | 0.888 | 0.733 |
| 2.528982086139765 | 0.978 | 0.89 | 0.735 |
| 2.532123678793355 | 0.978 | 0.892 | 0.738 |
| 2.535265271446944 | 0.979 | 0.895 | 0.74 |
| 2.538406864100534 | 0.979 | 0.897 | 0.743 |
| 2.541548456754124 | 0.979 | 0.899 | 0.746 |
| 2.544690049407713 | 0.979 | 0.901 | 0.748 |
| 2.547831642061302 | 0.979 | 0.903 | 0.751 |
| 2.550973234714892 | 0.979 | 0.905 | 0.754 |
| 2.554114827368482 | 0.979 | 0.907 | 0.757 |
| 2.557256420022072 | 0.979 | 0.909 | 0.759 |
| 2.560398012675661 | 0.979 | 0.911 | 0.762 |
| 2.563539605329251 | 0.979 | 0.912 | 0.765 |
| 2.56668119798284 | 0.979 | 0.914 | 0.768 |
| 2.56982279063643 | 0.98 | 0.916 | 0.771 |
| 2.57296438329002 | 0.98 | 0.918 | 0.774 |
| 2.576105975943609 | 0.98 | 0.92 | 0.777 |
| 2.579247568597199 | 0.98 | 0.921 | 0.78 |
| 2.582389161250788 | 0.98 | 0.923 | 0.783 |
| 2.585530753904377 | 0.98 | 0.925 | 0.786 |
| 2.588672346557967 | 0.98 | 0.926 | 0.789 |
| 2.591813939211557 | 0.98 | 0.928 | 0.792 |
| 2.594955531865147 | 0.98 | 0.929 | 0.795 |
| 2.598097124518736 | 0.98 | 0.931 | 0.798 |
| 2.601238717172326 | 0.98 | 0.932 | 0.801 |
| 2.604380309825915 | 0.98 | 0.934 | 0.805 |
| 2.607521902479505 | 0.98 | 0.935 | 0.808 |
| 2.610663495133095 | 0.98 | 0.937 | 0.811 |
| 2.613805087786684 | 0.98 | 0.938 | 0.814 |
| 2.616946680440274 | 0.98 | 0.939 | 0.817 |
| 2.620088273093863 | 0.981 | 0.941 | 0.82 |
| 2.623229865747452 | 0.981 | 0.942 | 0.823 |
| 2.626371458401042 | 0.981 | 0.943 | 0.826 |
| 2.629513051054632 | 0.981 | 0.945 | 0.83 |
| 2.632654643708222 | 0.981 | 0.946 | 0.833 |
| 2.635796236361811 | 0.981 | 0.947 | 0.836 |
| 2.638937829015401 | 0.981 | 0.948 | 0.839 |
| 2.642079421668991 | 0.981 | 0.949 | 0.842 |
| 2.64522101432258 | 0.981 | 0.95 | 0.845 |
| 2.64836260697617 | 0.981 | 0.951 | 0.848 |
| 2.651504199629759 | 0.981 | 0.952 | 0.851 |
| 2.654645792283349 | 0.981 | 0.953 | 0.854 |
| 2.657787384936938 | 0.981 | 0.954 | 0.857 |
| 2.660928977590528 | 0.981 | 0.955 | 0.86 |
| 2.664070570244118 | 0.981 | 0.956 | 0.863 |
| 2.667212162897707 | 0.981 | 0.957 | 0.866 |
| 2.670353755551297 | 0.981 | 0.958 | 0.869 |
| 2.673495348204887 | 0.981 | 0.959 | 0.872 |
| 2.676636940858476 | 0.981 | 0.96 | 0.875 |
| 2.679778533512066 | 0.981 | 0.961 | 0.878 |
| 2.682920126165655 | 0.981 | 0.962 | 0.881 |
| 2.686061718819245 | 0.981 | 0.962 | 0.883 |
| 2.689203311472835 | 0.981 | 0.963 | 0.886 |
| 2.692344904126424 | 0.981 | 0.964 | 0.889 |
| 2.695486496780014 | 0.981 | 0.964 | 0.892 |
| 2.698628089433603 | 0.981 | 0.965 | 0.894 |
| 2.701769682087193 | 0.981 | 0.966 | 0.897 |
| 2.704911274740782 | 0.981 | 0.966 | 0.899 |
| 2.708052867394372 | 0.981 | 0.967 | 0.902 |
| 2.711194460047962 | 0.981 | 0.968 | 0.904 |
| 2.714336052701551 | 0.981 | 0.968 | 0.907 |
| 2.717477645355141 | 0.981 | 0.969 | 0.909 |
| 2.720619238008731 | 0.981 | 0.969 | 0.912 |
| 2.72376083066232 | 0.981 | 0.97 | 0.914 |
| 2.72690242331591 | 0.981 | 0.97 | 0.916 |
| 2.730044015969499 | 0.981 | 0.971 | 0.919 |
| 2.733185608623089 | 0.982 | 0.971 | 0.921 |
| 2.736327201276678 | 0.982 | 0.972 | 0.923 |
| 2.739468793930268 | 0.982 | 0.972 | 0.925 |
| 2.742610386583858 | 0.982 | 0.973 | 0.927 |
| 2.745751979237447 | 0.982 | 0.973 | 0.929 |
| 2.748893571891036 | 0.982 | 0.974 | 0.931 |
| 2.752035164544627 | 0.982 | 0.974 | 0.933 |
| 2.755176757198216 | 0.982 | 0.974 | 0.935 |
| 2.758318349851806 | 0.982 | 0.975 | 0.937 |
| 2.761459942505395 | 0.982 | 0.975 | 0.939 |
| 2.764601535158985 | 0.982 | 0.975 | 0.94 |
| 2.767743127812574 | 0.982 | 0.976 | 0.942 |
| 2.770884720466164 | 0.982 | 0.976 | 0.944 |
| 2.774026313119754 | 0.982 | 0.976 | 0.945 |
| 2.777167905773343 | 0.982 | 0.977 | 0.947 |
| 2.780309498426932 | 0.982 | 0.977 | 0.948 |
| 2.783451091080522 | 0.982 | 0.977 | 0.95 |
| 2.786592683734112 | 0.982 | 0.977 | 0.951 |
| 2.789734276387701 | 0.982 | 0.978 | 0.953 |
| 2.792875869041291 | 0.982 | 0.978 | 0.954 |
| 2.796017461694881 | 0.982 | 0.978 | 0.955 |
| 2.79915905434847 | 0.982 | 0.978 | 0.957 |
| 2.80230064700206 | 0.982 | 0.978 | 0.958 |
| 2.80544223965565 | 0.982 | 0.979 | 0.959 |
| 2.808583832309239 | 0.982 | 0.979 | 0.96 |
| 2.811725424962829 | 0.982 | 0.979 | 0.961 |
| 2.814867017616419 | 0.982 | 0.979 | 0.962 |
| 2.818008610270008 | 0.982 | 0.979 | 0.963 |
| 2.821150202923598 | 0.982 | 0.979 | 0.964 |
| 2.824291795577187 | 0.982 | 0.98 | 0.965 |
| 2.827433388230777 | 0.982 | 0.98 | 0.966 |
| 2.830574980884366 | 0.982 | 0.98 | 0.967 |
| 2.833716573537956 | 0.982 | 0.98 | 0.968 |
| 2.836858166191546 | 0.982 | 0.98 | 0.969 |
| 2.839999758845135 | 0.982 | 0.98 | 0.969 |
| 2.843141351498725 | 0.982 | 0.98 | 0.97 |
| 2.846282944152314 | 0.982 | 0.98 | 0.971 |
| 2.849424536805904 | 0.982 | 0.98 | 0.971 |
| 2.852566129459494 | 0.982 | 0.981 | 0.972 |
| 2.855707722113083 | 0.982 | 0.981 | 0.973 |
| 2.858849314766673 | 0.982 | 0.981 | 0.973 |
| 2.861990907420262 | 0.982 | 0.981 | 0.974 |
| 2.865132500073852 | 0.982 | 0.981 | 0.974 |
| 2.868274092727442 | 0.982 | 0.981 | 0.975 |
| 2.871415685381031 | 0.982 | 0.981 | 0.975 |
| 2.874557278034621 | 0.982 | 0.981 | 0.976 |
| 2.87769887068821 | 0.982 | 0.981 | 0.976 |
| 2.8808404633418 | 0.982 | 0.981 | 0.976 |
| 2.88398205599539 | 0.982 | 0.981 | 0.977 |
| 2.88712364864898 | 0.982 | 0.981 | 0.977 |
| 2.890265241302569 | 0.982 | 0.981 | 0.978 |
| 2.893406833956158 | 0.982 | 0.981 | 0.978 |
| 2.896548426609748 | 0.982 | 0.981 | 0.978 |
| 2.899690019263338 | 0.982 | 0.981 | 0.978 |
| 2.902831611916927 | 0.982 | 0.981 | 0.979 |
| 2.905973204570517 | 0.982 | 0.981 | 0.979 |
| 2.909114797224106 | 0.982 | 0.981 | 0.979 |
| 2.912256389877696 | 0.982 | 0.981 | 0.979 |
| 2.915397982531286 | 0.982 | 0.982 | 0.98 |
| 2.918539575184875 | 0.982 | 0.982 | 0.98 |
| 2.921681167838465 | 0.982 | 0.982 | 0.98 |
| 2.924822760492054 | 0.982 | 0.982 | 0.98 |
| 2.927964353145644 | 0.982 | 0.982 | 0.98 |
| 2.931105945799234 | 0.982 | 0.982 | 0.98 |
| 2.934247538452823 | 0.982 | 0.982 | 0.98 |
| 2.937389131106413 | 0.982 | 0.982 | 0.981 |
| 2.940530723760002 | 0.982 | 0.982 | 0.981 |
| 2.943672316413592 | 0.982 | 0.982 | 0.981 |
| 2.946813909067182 | 0.982 | 0.982 | 0.981 |
| 2.949955501720771 | 0.982 | 0.982 | 0.981 |
| 2.953097094374361 | 0.982 | 0.982 | 0.981 |
| 2.95623868702795 | 0.982 | 0.982 | 0.981 |
| 2.95938027968154 | 0.982 | 0.982 | 0.981 |
| 2.96252187233513 | 0.982 | 0.982 | 0.981 |
| 2.965663464988719 | 0.982 | 0.982 | 0.981 |
| 2.968805057642309 | 0.982 | 0.982 | 0.981 |
| 2.971946650295898 | 0.982 | 0.982 | 0.981 |
| 2.975088242949488 | 0.982 | 0.982 | 0.981 |
| 2.978229835603078 | 0.982 | 0.982 | 0.981 |
| 2.981371428256667 | 0.982 | 0.982 | 0.982 |
| 2.984513020910257 | 0.982 | 0.982 | 0.982 |
| 2.987654613563846 | 0.982 | 0.982 | 0.982 |
| 2.990796206217436 | 0.982 | 0.982 | 0.982 |
| 2.993937798871025 | 0.982 | 0.982 | 0.982 |
| 2.997079391524615 | 0.982 | 0.982 | 0.982 |
| 3.000220984178205 | 0.982 | 0.982 | 0.982 |
| 3.003362576831794 | 0.982 | 0.982 | 0.982 |
| 3.006504169485384 | 0.982 | 0.982 | 0.982 |
| 3.009645762138974 | 0.982 | 0.982 | 0.982 |
| 3.012787354792563 | 0.982 | 0.982 | 0.982 |
| 3.015928947446153 | 0.982 | 0.982 | 0.982 |
| 3.019070540099742 | 0.982 | 0.982 | 0.982 |
| 3.022212132753332 | 0.982 | 0.982 | 0.982 |
| 3.025353725406922 | 0.982 | 0.982 | 0.982 |
| 3.028495318060511 | 0.982 | 0.982 | 0.982 |
| 3.031636910714101 | 0.982 | 0.982 | 0.982 |
| 3.03477850336769 | 0.982 | 0.982 | 0.982 |
| 3.03792009602128 | 0.982 | 0.982 | 0.982 |
| 3.04106168867487 | 0.982 | 0.982 | 0.982 |
| 3.04420328132846 | 0.982 | 0.982 | 0.982 |
| 3.047344873982049 | 0.982 | 0.982 | 0.982 |
| 3.050486466635638 | 0.982 | 0.982 | 0.982 |
| 3.053628059289228 | 0.982 | 0.982 | 0.982 |
| 3.056769651942818 | 0.982 | 0.982 | 0.982 |
| 3.059911244596407 | 0.982 | 0.982 | 0.982 |
| 3.063052837249997 | 0.982 | 0.982 | 0.982 |
| 3.066194429903586 | 0.982 | 0.982 | 0.982 |
| 3.069336022557176 | 0.982 | 0.982 | 0.982 |
| 3.072477615210766 | 0.982 | 0.982 | 0.982 |
| 3.075619207864355 | 0.982 | 0.982 | 0.982 |
| 3.078760800517945 | 0.982 | 0.982 | 0.982 |
| 3.081902393171534 | 0.982 | 0.982 | 0.982 |
| 3.085043985825124 | 0.982 | 0.982 | 0.982 |
| 3.088185578478713 | 0.982 | 0.982 | 0.982 |
| 3.091327171132303 | 0.982 | 0.982 | 0.982 |
| 3.094468763785893 | 0.982 | 0.982 | 0.982 |
| 3.097610356439482 | 0.982 | 0.982 | 0.982 |
| 3.100751949093072 | 0.982 | 0.982 | 0.982 |
| 3.103893541746661 | 0.982 | 0.982 | 0.982 |
| 3.107035134400251 | 0.982 | 0.982 | 0.982 |
| 3.110176727053841 | 0.982 | 0.982 | 0.982 |
| 3.11331831970743 | 0.982 | 0.982 | 0.982 |
| 3.11645991236102 | 0.982 | 0.982 | 0.982 |
| 3.11960150501461 | 0.982 | 0.982 | 0.982 |
| 3.122743097668199 | 0.982 | 0.982 | 0.982 |
| 3.125884690321789 | 0.982 | 0.982 | 0.982 |
| 3.129026282975378 | 0.982 | 0.982 | 0.982 |
| 3.132167875628968 | 0.982 | 0.982 | 0.982 |
| 3.135309468282557 | 0.982 | 0.982 | 0.982 |
| 3.138451060936147 | 0.982 | 0.982 | 0.982 |
| 3.141592653589737 | 0.982 | 0.982 | 0.982 |
| 3.144734246243326 | 0.982 | 0.982 | 0.982 |
| 3.147875838896916 | 0.982 | 0.982 | 0.982 |
| 3.151017431550505 | 0.982 | 0.982 | 0.982 |
| 3.154159024204095 | 0.982 | 0.982 | 0.982 |
| 3.157300616857685 | 0.982 | 0.982 | 0.982 |
| 3.160442209511274 | 0.982 | 0.982 | 0.982 |
| 3.163583802164864 | 0.982 | 0.982 | 0.982 |
| 3.166725394818453 | 0.982 | 0.982 | 0.982 |
| 3.169866987472043 | 0.982 | 0.982 | 0.982 |
| 3.173008580125633 | 0.982 | 0.982 | 0.982 |
| 3.176150172779222 | 0.982 | 0.982 | 0.982 |
| 3.179291765432812 | 0.982 | 0.982 | 0.982 |
| 3.182433358086401 | 0.982 | 0.982 | 0.982 |
| 3.185574950739991 | 0.982 | 0.982 | 0.982 |
| 3.188716543393581 | 0.982 | 0.982 | 0.982 |
| 3.19185813604717 | 0.982 | 0.982 | 0.982 |
| 3.19499972870076 | 0.982 | 0.982 | 0.982 |
| 3.198141321354349 | 0.982 | 0.982 | 0.982 |
| 3.20128291400794 | 0.982 | 0.982 | 0.982 |
| 3.204424506661528 | 0.982 | 0.982 | 0.982 |
| 3.207566099315118 | 0.982 | 0.982 | 0.982 |
| 3.210707691968708 | 0.982 | 0.982 | 0.982 |
| 3.213849284622297 | 0.982 | 0.982 | 0.982 |
| 3.216990877275887 | 0.982 | 0.982 | 0.982 |
| 3.220132469929476 | 0.982 | 0.982 | 0.982 |
| 3.223274062583066 | 0.982 | 0.982 | 0.982 |
| 3.226415655236656 | 0.982 | 0.982 | 0.982 |
| 3.229557247890245 | 0.982 | 0.982 | 0.982 |
| 3.232698840543835 | 0.982 | 0.982 | 0.982 |
| 3.235840433197425 | 0.982 | 0.982 | 0.982 |
| 3.238982025851014 | 0.982 | 0.982 | 0.982 |
| 3.242123618504604 | 0.982 | 0.982 | 0.982 |
| 3.245265211158193 | 0.982 | 0.982 | 0.982 |
| 3.248406803811783 | 0.982 | 0.982 | 0.982 |
| 3.251548396465373 | 0.982 | 0.982 | 0.982 |
| 3.254689989118962 | 0.982 | 0.982 | 0.982 |
| 3.257831581772551 | 0.982 | 0.982 | 0.982 |
| 3.260973174426141 | 0.982 | 0.982 | 0.982 |
| 3.26411476707973 | 0.982 | 0.982 | 0.982 |
| 3.267256359733321 | 0.982 | 0.982 | 0.982 |
| 3.27039795238691 | 0.982 | 0.982 | 0.982 |
| 3.2735395450405 | 0.982 | 0.982 | 0.982 |
| 3.276681137694089 | 0.982 | 0.982 | 0.982 |
| 3.279822730347679 | 0.982 | 0.982 | 0.982 |
| 3.282964323001269 | 0.982 | 0.982 | 0.982 |
| 3.286105915654858 | 0.982 | 0.982 | 0.982 |
| 3.289247508308448 | 0.982 | 0.982 | 0.982 |
| 3.292389100962037 | 0.982 | 0.982 | 0.982 |
| 3.295530693615627 | 0.982 | 0.982 | 0.982 |
| 3.298672286269217 | 0.982 | 0.982 | 0.982 |
| 3.301813878922806 | 0.982 | 0.982 | 0.982 |
| 3.304955471576396 | 0.982 | 0.982 | 0.982 |
| 3.308097064229985 | 0.982 | 0.982 | 0.982 |
| 3.311238656883575 | 0.982 | 0.982 | 0.982 |
| 3.314380249537165 | 0.982 | 0.982 | 0.982 |
| 3.317521842190754 | 0.982 | 0.982 | 0.982 |
| 3.320663434844344 | 0.982 | 0.982 | 0.982 |
| 3.323805027497933 | 0.982 | 0.982 | 0.982 |
| 3.326946620151523 | 0.982 | 0.982 | 0.982 |
| 3.330088212805113 | 0.982 | 0.982 | 0.982 |
| 3.333229805458702 | 0.982 | 0.982 | 0.983 |
| 3.336371398112292 | 0.982 | 0.982 | 0.983 |
| 3.339512990765881 | 0.982 | 0.982 | 0.983 |
| 3.342654583419471 | 0.982 | 0.982 | 0.983 |
| 3.345796176073061 | 0.982 | 0.982 | 0.983 |
| 3.34893776872665 | 0.982 | 0.982 | 0.983 |
| 3.35207936138024 | 0.982 | 0.982 | 0.983 |
| 3.355220954033829 | 0.982 | 0.982 | 0.983 |
| 3.358362546687419 | 0.982 | 0.982 | 0.983 |
| 3.361504139341009 | 0.982 | 0.982 | 0.984 |
| 3.364645731994598 | 0.982 | 0.982 | 0.984 |
| 3.367787324648188 | 0.982 | 0.982 | 0.984 |
| 3.370928917301777 | 0.982 | 0.982 | 0.984 |
| 3.374070509955367 | 0.982 | 0.982 | 0.984 |
| 3.377212102608956 | 0.982 | 0.982 | 0.985 |
| 3.380353695262546 | 0.982 | 0.982 | 0.985 |
| 3.383495287916136 | 0.982 | 0.982 | 0.985 |
| 3.386636880569725 | 0.982 | 0.982 | 0.985 |
| 3.389778473223315 | 0.982 | 0.982 | 0.986 |
| 3.392920065876904 | 0.982 | 0.982 | 0.986 |
| 3.396061658530494 | 0.982 | 0.982 | 0.986 |
| 3.399203251184084 | 0.982 | 0.982 | 0.987 |
| 3.402344843837673 | 0.982 | 0.982 | 0.987 |
| 3.405486436491263 | 0.982 | 0.982 | 0.987 |
| 3.408628029144852 | 0.982 | 0.982 | 0.988 |
| 3.411769621798442 | 0.982 | 0.983 | 0.988 |
| 3.414911214452032 | 0.982 | 0.983 | 0.989 |
| 3.418052807105621 | 0.982 | 0.983 | 0.989 |
| 3.421194399759211 | 0.982 | 0.983 | 0.99 |
| 3.4243359924128 | 0.982 | 0.983 | 0.99 |
| 3.42747758506639 | 0.982 | 0.983 | 0.991 |
| 3.43061917771998 | 0.982 | 0.983 | 0.992 |
| 3.433760770373569 | 0.982 | 0.983 | 0.992 |
| 3.436902363027159 | 0.982 | 0.983 | 0.993 |
| 3.440043955680748 | 0.982 | 0.983 | 0.993 |
| 3.443185548334338 | 0.982 | 0.983 | 0.994 |
| 3.446327140987927 | 0.982 | 0.983 | 0.995 |
| 3.449468733641517 | 0.982 | 0.984 | 0.996 |
| 3.452610326295107 | 0.982 | 0.984 | 0.997 |
| 3.455751918948696 | 0.982 | 0.984 | 0.997 |
| 3.458893511602286 | 0.982 | 0.984 | 0.998 |
| 3.462035104255876 | 0.982 | 0.984 | 0.999 |
| 3.465176696909465 | 0.982 | 0.984 | 1 |
| 3.468318289563055 | 0.982 | 0.984 | 1.001 |
| 3.471459882216644 | 0.982 | 0.985 | 1.002 |
| 3.474601474870234 | 0.982 | 0.985 | 1.003 |
| 3.477743067523824 | 0.982 | 0.985 | 1.005 |
| 3.480884660177413 | 0.982 | 0.985 | 1.006 |
| 3.484026252831002 | 0.982 | 0.985 | 1.007 |
| 3.487167845484592 | 0.982 | 0.985 | 1.008 |
| 3.490309438138182 | 0.982 | 0.986 | 1.009 |
| 3.493451030791772 | 0.982 | 0.986 | 1.011 |
| 3.496592623445361 | 0.982 | 0.986 | 1.012 |
| 3.499734216098951 | 0.982 | 0.986 | 1.014 |
| 3.50287580875254 | 0.982 | 0.987 | 1.015 |
| 3.50601740140613 | 0.982 | 0.987 | 1.017 |
| 3.50915899405972 | 0.982 | 0.987 | 1.018 |
| 3.512300586713309 | 0.982 | 0.987 | 1.02 |
| 3.515442179366899 | 0.982 | 0.988 | 1.021 |
| 3.518583772020488 | 0.982 | 0.988 | 1.023 |
| 3.521725364674078 | 0.982 | 0.988 | 1.025 |
| 3.524866957327668 | 0.982 | 0.989 | 1.027 |
| 3.528008549981257 | 0.982 | 0.989 | 1.029 |
| 3.531150142634847 | 0.982 | 0.989 | 1.03 |
| 3.534291735288436 | 0.982 | 0.99 | 1.032 |
| 3.537433327942026 | 0.982 | 0.99 | 1.034 |
| 3.540574920595616 | 0.982 | 0.991 | 1.036 |
| 3.543716513249205 | 0.982 | 0.991 | 1.038 |
| 3.546858105902795 | 0.982 | 0.992 | 1.041 |
| 3.549999698556384 | 0.982 | 0.992 | 1.043 |
| 3.553141291209974 | 0.982 | 0.993 | 1.045 |
| 3.556282883863564 | 0.982 | 0.993 | 1.047 |
| 3.559424476517153 | 0.982 | 0.994 | 1.049 |
| 3.562566069170743 | 0.982 | 0.994 | 1.052 |
| 3.565707661824332 | 0.982 | 0.995 | 1.054 |
| 3.568849254477922 | 0.982 | 0.995 | 1.057 |
| 3.571990847131511 | 0.982 | 0.996 | 1.059 |
| 3.575132439785101 | 0.982 | 0.996 | 1.062 |
| 3.578274032438691 | 0.982 | 0.997 | 1.064 |
| 3.58141562509228 | 0.982 | 0.998 | 1.067 |
| 3.58455721774587 | 0.982 | 0.998 | 1.069 |
| 3.58769881039946 | 0.982 | 0.999 | 1.072 |
| 3.590840403053049 | 0.982 | 1 | 1.075 |
| 3.593981995706639 | 0.982 | 1 | 1.077 |
| 3.597123588360228 | 0.982 | 1.001 | 1.08 |
| 3.600265181013818 | 0.982 | 1.002 | 1.083 |
| 3.603406773667407 | 0.982 | 1.003 | 1.086 |
| 3.606548366320997 | 0.982 | 1.004 | 1.089 |
| 3.609689958974587 | 0.982 | 1.004 | 1.091 |
| 3.612831551628176 | 0.982 | 1.005 | 1.094 |
| 3.615973144281766 | 0.982 | 1.006 | 1.097 |
| 3.619114736935355 | 0.982 | 1.007 | 1.1 |
| 3.622256329588945 | 0.982 | 1.008 | 1.103 |
| 3.625397922242534 | 0.982 | 1.009 | 1.106 |
| 3.628539514896124 | 0.983 | 1.01 | 1.109 |
| 3.631681107549714 | 0.983 | 1.011 | 1.112 |
| 3.634822700203303 | 0.983 | 1.012 | 1.115 |
| 3.637964292856893 | 0.983 | 1.013 | 1.118 |
| 3.641105885510483 | 0.983 | 1.014 | 1.121 |
| 3.644247478164072 | 0.983 | 1.015 | 1.125 |
| 3.647389070817662 | 0.983 | 1.017 | 1.128 |
| 3.650530663471251 | 0.983 | 1.018 | 1.131 |
| 3.653672256124841 | 0.983 | 1.019 | 1.134 |
| 3.656813848778431 | 0.983 | 1.02 | 1.137 |
| 3.65995544143202 | 0.983 | 1.021 | 1.14 |
| 3.66309703408561 | 0.983 | 1.023 | 1.143 |
| 3.666238626739199 | 0.983 | 1.024 | 1.146 |
| 3.66938021939279 | 0.983 | 1.025 | 1.15 |
| 3.672521812046378 | 0.983 | 1.027 | 1.153 |
| 3.675663404699968 | 0.983 | 1.028 | 1.156 |
| 3.678804997353558 | 0.983 | 1.03 | 1.159 |
| 3.681946590007147 | 0.983 | 1.031 | 1.162 |
| 3.685088182660737 | 0.983 | 1.033 | 1.165 |
| 3.688229775314326 | 0.983 | 1.034 | 1.168 |
| 3.691371367967916 | 0.983 | 1.036 | 1.171 |
| 3.694512960621506 | 0.984 | 1.037 | 1.174 |
| 3.697654553275095 | 0.984 | 1.039 | 1.178 |
| 3.700796145928685 | 0.984 | 1.041 | 1.181 |
| 3.703937738582274 | 0.984 | 1.042 | 1.184 |
| 3.707079331235864 | 0.984 | 1.044 | 1.187 |
| 3.710220923889454 | 0.984 | 1.046 | 1.19 |
| 3.713362516543043 | 0.984 | 1.047 | 1.193 |
| 3.716504109196633 | 0.984 | 1.049 | 1.195 |
| 3.719645701850223 | 0.984 | 1.051 | 1.198 |
| 3.722787294503812 | 0.984 | 1.053 | 1.201 |
| 3.725928887157402 | 0.984 | 1.055 | 1.204 |
| 3.729070479810991 | 0.984 | 1.057 | 1.207 |
| 3.732212072464581 | 0.984 | 1.059 | 1.21 |
| 3.735353665118171 | 0.985 | 1.061 | 1.213 |
| 3.73849525777176 | 0.985 | 1.063 | 1.215 |
| 3.74163685042535 | 0.985 | 1.065 | 1.218 |
| 3.744778443078939 | 0.985 | 1.067 | 1.221 |
| 3.747920035732529 | 0.985 | 1.069 | 1.223 |
| 3.751061628386119 | 0.985 | 1.071 | 1.226 |
| 3.754203221039708 | 0.985 | 1.073 | 1.228 |
| 3.757344813693298 | 0.985 | 1.075 | 1.231 |
| 3.760486406346887 | 0.985 | 1.078 | 1.233 |
| 3.763627999000477 | 0.986 | 1.08 | 1.236 |
| 3.766769591654067 | 0.986 | 1.082 | 1.238 |
| 3.769911184307656 | 0.986 | 1.084 | 1.241 |
| 3.773052776961246 | 0.986 | 1.087 | 1.243 |
| 3.776194369614835 | 0.986 | 1.089 | 1.245 |
| 3.779335962268425 | 0.986 | 1.092 | 1.247 |
| 3.782477554922014 | 0.986 | 1.094 | 1.249 |
| 3.785619147575604 | 0.986 | 1.096 | 1.252 |
| 3.788760740229193 | 0.987 | 1.099 | 1.254 |
| 3.791902332882783 | 0.987 | 1.101 | 1.256 |
| 3.795043925536373 | 0.987 | 1.104 | 1.258 |
| 3.798185518189962 | 0.987 | 1.106 | 1.26 |
| 3.801327110843552 | 0.987 | 1.109 | 1.262 |
| 3.804468703497142 | 0.987 | 1.112 | 1.263 |
| 3.807610296150731 | 0.988 | 1.114 | 1.265 |
| 3.810751888804321 | 0.988 | 1.117 | 1.267 |
| 3.813893481457911 | 0.988 | 1.12 | 1.269 |
| 3.8170350741115 | 0.988 | 1.122 | 1.27 |
| 3.82017666676509 | 0.988 | 1.125 | 1.272 |
| 3.823318259418679 | 0.989 | 1.128 | 1.274 |
| 3.826459852072269 | 0.989 | 1.131 | 1.275 |
| 3.829601444725859 | 0.989 | 1.133 | 1.277 |
| 3.832743037379448 | 0.989 | 1.136 | 1.278 |
| 3.835884630033038 | 0.989 | 1.139 | 1.279 |
| 3.839026222686627 | 0.99 | 1.142 | 1.281 |
| 3.842167815340217 | 0.99 | 1.145 | 1.282 |
| 3.845309407993807 | 0.99 | 1.148 | 1.283 |
| 3.848451000647396 | 0.99 | 1.151 | 1.285 |
| 3.851592593300986 | 0.991 | 1.153 | 1.286 |
| 3.854734185954575 | 0.991 | 1.156 | 1.287 |
| 3.857875778608165 | 0.991 | 1.159 | 1.288 |
| 3.861017371261755 | 0.991 | 1.162 | 1.289 |
| 3.864158963915344 | 0.992 | 1.165 | 1.29 |
| 3.867300556568933 | 0.992 | 1.168 | 1.291 |
| 3.870442149222523 | 0.992 | 1.171 | 1.292 |
| 3.873583741876112 | 0.992 | 1.174 | 1.293 |
| 3.876725334529703 | 0.993 | 1.177 | 1.294 |
| 3.879866927183292 | 0.993 | 1.18 | 1.295 |
| 3.883008519836882 | 0.993 | 1.184 | 1.296 |
| 3.886150112490471 | 0.994 | 1.187 | 1.296 |
| 3.889291705144061 | 0.994 | 1.19 | 1.297 |
| 3.892433297797651 | 0.994 | 1.193 | 1.298 |
| 3.89557489045124 | 0.994 | 1.196 | 1.298 |
| 3.89871648310483 | 0.995 | 1.199 | 1.299 |
| 3.901858075758419 | 0.995 | 1.202 | 1.3 |
| 3.904999668412009 | 0.995 | 1.205 | 1.3 |
| 3.908141261065598 | 0.996 | 1.208 | 1.301 |
| 3.911282853719188 | 0.996 | 1.211 | 1.301 |
| 3.914424446372778 | 0.997 | 1.215 | 1.302 |
| 3.917566039026367 | 0.997 | 1.218 | 1.302 |
| 3.920707631679957 | 0.997 | 1.221 | 1.303 |
| 3.923849224333547 | 0.998 | 1.224 | 1.303 |
| 3.926990816987136 | 0.998 | 1.227 | 1.304 |
| 3.930132409640726 | 0.998 | 1.23 | 1.304 |
| 3.933274002294315 | 0.999 | 1.233 | 1.304 |
| 3.936415594947905 | 0.999 | 1.237 | 1.305 |
| 3.939557187601495 | 1 | 1.24 | 1.305 |
| 3.942698780255084 | 1 | 1.243 | 1.305 |
| 3.945840372908674 | 1.001 | 1.246 | 1.306 |
| 3.948981965562263 | 1.001 | 1.249 | 1.306 |
| 3.952123558215853 | 1.001 | 1.252 | 1.306 |
| 3.955265150869442 | 1.002 | 1.255 | 1.306 |
| 3.958406743523032 | 1.002 | 1.258 | 1.307 |
| 3.961548336176622 | 1.003 | 1.262 | 1.307 |
| 3.964689928830211 | 1.003 | 1.265 | 1.307 |
| 3.967831521483801 | 1.004 | 1.268 | 1.307 |
| 3.97097311413739 | 1.004 | 1.271 | 1.307 |
| 3.97411470679098 | 1.005 | 1.274 | 1.307 |
| 3.97725629944457 | 1.005 | 1.277 | 1.308 |
| 3.98039789209816 | 1.006 | 1.28 | 1.308 |
| 3.983539484751749 | 1.006 | 1.283 | 1.308 |
| 3.986681077405338 | 1.007 | 1.286 | 1.308 |
| 3.989822670058928 | 1.007 | 1.289 | 1.308 |
| 3.992964262712517 | 1.008 | 1.292 | 1.308 |
| 3.996105855366107 | 1.009 | 1.295 | 1.308 |
| 3.999247448019697 | 1.009 | 1.298 | 1.308 |
| 4.002389040673287 | 1.01 | 1.301 | 1.308 |
| 4.005530633326877 | 1.01 | 1.304 | 1.308 |
| 4.008672225980466 | 1.011 | 1.307 | 1.308 |
| 4.011813818634056 | 1.012 | 1.31 | 1.309 |
| 4.014955411287645 | 1.012 | 1.312 | 1.309 |
| 4.018097003941234 | 1.013 | 1.315 | 1.309 |
| 4.021238596594824 | 1.014 | 1.318 | 1.309 |
| 4.024380189248414 | 1.014 | 1.321 | 1.309 |
| 4.027521781902004 | 1.015 | 1.324 | 1.309 |
| 4.030663374555593 | 1.016 | 1.327 | 1.309 |
| 4.033804967209183 | 1.016 | 1.329 | 1.309 |
| 4.036946559862773 | 1.017 | 1.332 | 1.309 |
| 4.040088152516362 | 1.018 | 1.335 | 1.309 |
| 4.043229745169951 | 1.018 | 1.337 | 1.309 |
| 4.046371337823541 | 1.019 | 1.34 | 1.309 |
| 4.049512930477131 | 1.02 | 1.343 | 1.309 |
| 4.05265452313072 | 1.021 | 1.345 | 1.309 |
| 4.05579611578431 | 1.021 | 1.348 | 1.309 |
| 4.0589377084379 | 1.022 | 1.35 | 1.309 |
| 4.062079301091489 | 1.023 | 1.353 | 1.309 |
| 4.065220893745079 | 1.024 | 1.355 | 1.309 |
| 4.068362486398668 | 1.025 | 1.358 | 1.309 |
| 4.071504079052258 | 1.025 | 1.36 | 1.309 |
| 4.074645671705848 | 1.026 | 1.363 | 1.309 |
| 4.077787264359437 | 1.027 | 1.365 | 1.309 |
| 4.080928857013027 | 1.028 | 1.368 | 1.309 |
| 4.084070449666616 | 1.029 | 1.37 | 1.309 |
| 4.087212042320206 | 1.03 | 1.372 | 1.309 |
| 4.090353634973795 | 1.031 | 1.375 | 1.309 |
| 4.093495227627385 | 1.032 | 1.377 | 1.309 |
| 4.096636820280975 | 1.032 | 1.379 | 1.309 |
| 4.099778412934564 | 1.033 | 1.381 | 1.309 |
| 4.102920005588154 | 1.034 | 1.383 | 1.309 |
| 4.106061598241744 | 1.035 | 1.385 | 1.309 |
| 4.109203190895333 | 1.036 | 1.388 | 1.309 |
| 4.112344783548923 | 1.037 | 1.39 | 1.309 |
| 4.115486376202512 | 1.038 | 1.392 | 1.309 |
| 4.118627968856102 | 1.039 | 1.394 | 1.309 |
| 4.121769561509692 | 1.04 | 1.396 | 1.309 |
| 4.124911154163281 | 1.041 | 1.398 | 1.309 |
| 4.128052746816871 | 1.042 | 1.4 | 1.309 |
| 4.13119433947046 | 1.043 | 1.401 | 1.309 |
| 4.13433593212405 | 1.045 | 1.403 | 1.309 |
| 4.13747752477764 | 1.046 | 1.405 | 1.309 |
| 4.14061911743123 | 1.047 | 1.407 | 1.309 |
| 4.143760710084818 | 1.048 | 1.409 | 1.309 |
| 4.146902302738408 | 1.049 | 1.41 | 1.309 |
| 4.150043895391998 | 1.05 | 1.412 | 1.309 |
| 4.153185488045588 | 1.051 | 1.414 | 1.309 |
| 4.156327080699177 | 1.052 | 1.416 | 1.309 |
| 4.159468673352766 | 1.054 | 1.417 | 1.309 |
| 4.162610266006356 | 1.055 | 1.419 | 1.309 |
| 4.165751858659946 | 1.056 | 1.42 | 1.309 |
| 4.168893451313535 | 1.057 | 1.422 | 1.309 |
| 4.172035043967125 | 1.059 | 1.423 | 1.309 |
| 4.175176636620715 | 1.06 | 1.425 | 1.309 |
| 4.178318229274304 | 1.061 | 1.426 | 1.309 |
| 4.181459821927894 | 1.062 | 1.428 | 1.309 |
| 4.184601414581484 | 1.064 | 1.429 | 1.309 |
| 4.187743007235073 | 1.065 | 1.43 | 1.309 |
| 4.190884599888663 | 1.066 | 1.432 | 1.309 |
| 4.194026192542252 | 1.068 | 1.433 | 1.309 |
| 4.197167785195842 | 1.069 | 1.434 | 1.309 |
| 4.200309377849432 | 1.07 | 1.435 | 1.309 |
| 4.203450970503021 | 1.072 | 1.437 | 1.309 |
| 4.206592563156611 | 1.073 | 1.438 | 1.309 |
| 4.2097341558102 | 1.075 | 1.439 | 1.309 |
| 4.21287574846379 | 1.076 | 1.44 | 1.309 |
| 4.21601734111738 | 1.077 | 1.441 | 1.309 |
| 4.21915893377097 | 1.079 | 1.442 | 1.309 |
| 4.222300526424559 | 1.08 | 1.443 | 1.309 |
| 4.225442119078148 | 1.082 | 1.444 | 1.309 |
| 4.228583711731738 | 1.083 | 1.445 | 1.309 |
| 4.231725304385327 | 1.085 | 1.446 | 1.309 |
| 4.234866897038917 | 1.086 | 1.447 | 1.309 |
| 4.238008489692506 | 1.088 | 1.448 | 1.309 |
| 4.241150082346096 | 1.09 | 1.449 | 1.309 |
| 4.244291674999685 | 1.091 | 1.45 | 1.309 |
| 4.247433267653276 | 1.093 | 1.451 | 1.309 |
| 4.250574860306865 | 1.094 | 1.452 | 1.309 |
| 4.253716452960455 | 1.096 | 1.452 | 1.309 |
| 4.256858045614044 | 1.098 | 1.453 | 1.309 |
| 4.259999638267634 | 1.099 | 1.454 | 1.309 |
| 4.263141230921224 | 1.101 | 1.455 | 1.309 |
| 4.266282823574813 | 1.103 | 1.455 | 1.309 |
| 4.269424416228403 | 1.104 | 1.456 | 1.309 |
| 4.272566008881992 | 1.106 | 1.457 | 1.309 |
| 4.275707601535582 | 1.108 | 1.457 | 1.309 |
| 4.27884919418917 | 1.11 | 1.458 | 1.309 |
| 4.28199078684276 | 1.111 | 1.459 | 1.309 |
| 4.285132379496351 | 1.113 | 1.459 | 1.309 |
| 4.28827397214994 | 1.115 | 1.46 | 1.309 |
| 4.29141556480353 | 1.117 | 1.46 | 1.309 |
| 4.294557157457119 | 1.118 | 1.461 | 1.309 |
| 4.29769875011071 | 1.12 | 1.461 | 1.309 |
| 4.300840342764299 | 1.122 | 1.462 | 1.309 |
| 4.303981935417888 | 1.124 | 1.462 | 1.309 |
| 4.307123528071478 | 1.126 | 1.463 | 1.309 |
| 4.310265120725067 | 1.128 | 1.463 | 1.309 |
| 4.313406713378657 | 1.13 | 1.464 | 1.309 |
| 4.316548306032247 | 1.132 | 1.464 | 1.309 |
| 4.319689898685836 | 1.134 | 1.464 | 1.309 |
| 4.322831491339426 | 1.136 | 1.465 | 1.309 |
| 4.325973083993015 | 1.138 | 1.465 | 1.309 |
| 4.329114676646605 | 1.14 | 1.466 | 1.309 |
| 4.332256269300195 | 1.142 | 1.466 | 1.309 |
| 4.335397861953784 | 1.144 | 1.466 | 1.309 |
| 4.338539454607374 | 1.146 | 1.467 | 1.309 |
| 4.341681047260963 | 1.148 | 1.467 | 1.309 |
| 4.344822639914553 | 1.15 | 1.467 | 1.309 |
| 4.347964232568143 | 1.152 | 1.467 | 1.309 |
| 4.351105825221732 | 1.154 | 1.468 | 1.309 |
| 4.354247417875322 | 1.156 | 1.468 | 1.309 |
| 4.357389010528911 | 1.158 | 1.468 | 1.309 |
| 4.360530603182501 | 1.16 | 1.468 | 1.309 |
| 4.36367219583609 | 1.162 | 1.469 | 1.309 |
| 4.36681378848968 | 1.165 | 1.469 | 1.309 |
| 4.36995538114327 | 1.167 | 1.469 | 1.31 |
| 4.373096973796859 | 1.169 | 1.469 | 1.31 |
| 4.376238566450449 | 1.171 | 1.47 | 1.31 |
| 4.379380159104038 | 1.173 | 1.47 | 1.31 |
| 4.382521751757628 | 1.176 | 1.47 | 1.31 |
| 4.385663344411217 | 1.178 | 1.47 | 1.31 |
| 4.388804937064807 | 1.18 | 1.47 | 1.31 |
| 4.391946529718397 | 1.183 | 1.47 | 1.31 |
| 4.395088122371987 | 1.185 | 1.47 | 1.31 |
| 4.398229715025576 | 1.187 | 1.471 | 1.31 |
| 4.401371307679165 | 1.189 | 1.471 | 1.31 |
| 4.404512900332755 | 1.192 | 1.471 | 1.311 |
| 4.407654492986345 | 1.194 | 1.471 | 1.311 |
| 4.410796085639934 | 1.197 | 1.471 | 1.311 |
| 4.413937678293524 | 1.199 | 1.471 | 1.311 |
| 4.417079270947114 | 1.201 | 1.471 | 1.311 |
| 4.420220863600703 | 1.204 | 1.471 | 1.312 |
| 4.423362456254293 | 1.206 | 1.471 | 1.312 |
| 4.426504048907883 | 1.209 | 1.472 | 1.312 |
| 4.429645641561472 | 1.211 | 1.472 | 1.312 |
| 4.432787234215062 | 1.214 | 1.472 | 1.313 |
| 4.435928826868651 | 1.216 | 1.472 | 1.313 |
| 4.43907041952224 | 1.219 | 1.472 | 1.313 |
| 4.44221201217583 | 1.221 | 1.472 | 1.313 |
| 4.44535360482942 | 1.224 | 1.472 | 1.314 |
| 4.44849519748301 | 1.226 | 1.472 | 1.314 |
| 4.4516367901366 | 1.229 | 1.472 | 1.315 |
| 4.454778382790188 | 1.231 | 1.472 | 1.315 |
| 4.457919975443779 | 1.234 | 1.472 | 1.315 |
| 4.461061568097368 | 1.236 | 1.472 | 1.316 |
| 4.464203160750958 | 1.239 | 1.472 | 1.316 |
| 4.467344753404547 | 1.242 | 1.472 | 1.317 |
| 4.470486346058137 | 1.244 | 1.472 | 1.317 |
| 4.473627938711726 | 1.247 | 1.472 | 1.318 |
| 4.476769531365316 | 1.25 | 1.472 | 1.319 |
| 4.479911124018905 | 1.252 | 1.472 | 1.319 |
| 4.483052716672495 | 1.255 | 1.472 | 1.32 |
| 4.486194309326085 | 1.258 | 1.472 | 1.321 |
| 4.489335901979674 | 1.26 | 1.472 | 1.321 |
| 4.492477494633264 | 1.263 | 1.472 | 1.322 |
| 4.495619087286854 | 1.266 | 1.472 | 1.323 |
| 4.498760679940443 | 1.268 | 1.472 | 1.324 |
| 4.501902272594033 | 1.271 | 1.472 | 1.324 |
| 4.505043865247622 | 1.274 | 1.472 | 1.325 |
| 4.508185457901212 | 1.277 | 1.473 | 1.326 |
| 4.511327050554801 | 1.279 | 1.473 | 1.327 |
| 4.514468643208391 | 1.282 | 1.473 | 1.328 |
| 4.517610235861981 | 1.285 | 1.473 | 1.329 |
| 4.520751828515571 | 1.288 | 1.473 | 1.33 |
| 4.52389342116916 | 1.291 | 1.473 | 1.331 |
| 4.52703501382275 | 1.293 | 1.473 | 1.333 |
| 4.530176606476339 | 1.296 | 1.473 | 1.334 |
| 4.533318199129928 | 1.299 | 1.473 | 1.335 |
| 4.536459791783518 | 1.302 | 1.473 | 1.336 |
| 4.539601384437108 | 1.305 | 1.473 | 1.338 |
| 4.542742977090698 | 1.308 | 1.473 | 1.339 |
| 4.545884569744287 | 1.311 | 1.473 | 1.34 |
| 4.549026162397876 | 1.314 | 1.473 | 1.342 |
| 4.552167755051466 | 1.316 | 1.473 | 1.343 |
| 4.555309347705056 | 1.319 | 1.473 | 1.345 |
| 4.558450940358646 | 1.322 | 1.473 | 1.347 |
| 4.561592533012235 | 1.325 | 1.473 | 1.348 |
| 4.564734125665825 | 1.328 | 1.473 | 1.35 |
| 4.567875718319415 | 1.331 | 1.473 | 1.352 |
| 4.571017310973004 | 1.334 | 1.473 | 1.353 |
| 4.574158903626594 | 1.337 | 1.473 | 1.355 |
| 4.577300496280183 | 1.34 | 1.473 | 1.357 |
| 4.580442088933772 | 1.343 | 1.473 | 1.359 |
| 4.583583681587362 | 1.346 | 1.473 | 1.361 |
| 4.586725274240952 | 1.349 | 1.473 | 1.363 |
| 4.589866866894542 | 1.352 | 1.473 | 1.365 |
| 4.593008459548131 | 1.355 | 1.473 | 1.367 |
| 4.596150052201721 | 1.358 | 1.473 | 1.369 |
| 4.59929164485531 | 1.361 | 1.473 | 1.371 |
| 4.6024332375089 | 1.364 | 1.473 | 1.374 |
| 4.60557483016249 | 1.367 | 1.473 | 1.376 |
| 4.608716422816079 | 1.37 | 1.473 | 1.378 |
| 4.611858015469668 | 1.373 | 1.473 | 1.381 |
| 4.614999608123258 | 1.376 | 1.473 | 1.383 |
| 4.618141200776848 | 1.379 | 1.473 | 1.385 |
| 4.621282793430437 | 1.382 | 1.473 | 1.388 |
| 4.624424386084027 | 1.385 | 1.473 | 1.39 |
| 4.627565978737617 | 1.388 | 1.473 | 1.393 |
| 4.630707571391206 | 1.391 | 1.473 | 1.396 |
| 4.633849164044795 | 1.395 | 1.473 | 1.398 |
| 4.636990756698386 | 1.398 | 1.473 | 1.401 |
| 4.640132349351975 | 1.401 | 1.473 | 1.404 |
| 4.643273942005564 | 1.404 | 1.473 | 1.406 |
| 4.646415534659154 | 1.407 | 1.473 | 1.409 |
| 4.649557127312744 | 1.41 | 1.473 | 1.412 |
| 4.652698719966334 | 1.413 | 1.473 | 1.415 |
| 4.655840312619923 | 1.416 | 1.473 | 1.418 |
| 4.658981905273513 | 1.419 | 1.473 | 1.421 |
| 4.662123497927102 | 1.422 | 1.473 | 1.423 |
| 4.665265090580692 | 1.426 | 1.473 | 1.426 |
| 4.668406683234282 | 1.429 | 1.473 | 1.429 |
| 4.671548275887871 | 1.432 | 1.473 | 1.432 |
| 4.674689868541461 | 1.435 | 1.473 | 1.435 |
| 4.67783146119505 | 1.438 | 1.473 | 1.438 |
| 4.68097305384864 | 1.441 | 1.473 | 1.441 |
| 4.68411464650223 | 1.444 | 1.473 | 1.445 |
| 4.687256239155819 | 1.448 | 1.473 | 1.448 |
| 4.690397831809409 | 1.451 | 1.473 | 1.451 |
| 4.693539424462998 | 1.454 | 1.473 | 1.454 |
| 4.696681017116588 | 1.457 | 1.473 | 1.457 |
| 4.699822609770177 | 1.46 | 1.473 | 1.46 |
| 4.702964202423767 | 1.463 | 1.473 | 1.463 |
| 4.706105795077356 | 1.466 | 1.473 | 1.466 |
| 4.709247387730946 | 1.469 | 1.473 | 1.469 |
| 4.712388980384535 | 1.473 | 1.473 | 1.473 |
| 4.715530573038126 | 1.476 | 1.473 | 1.476 |
| 4.718672165691715 | 1.479 | 1.473 | 1.479 |
| 4.721813758345305 | 1.482 | 1.473 | 1.482 |
| 4.724955350998894 | 1.485 | 1.473 | 1.485 |
| 4.728096943652484 | 1.488 | 1.473 | 1.488 |
| 4.731238536306074 | 1.491 | 1.473 | 1.491 |
| 4.734380128959663 | 1.495 | 1.473 | 1.495 |
| 4.737521721613253 | 1.498 | 1.473 | 1.498 |
| 4.740663314266842 | 1.501 | 1.473 | 1.501 |
| 4.743804906920432 | 1.504 | 1.473 | 1.504 |
| 4.74694649957402 | 1.507 | 1.473 | 1.507 |
| 4.750088092227611 | 1.51 | 1.473 | 1.51 |
| 4.7532296848812 | 1.513 | 1.473 | 1.513 |
| 4.75637127753479 | 1.517 | 1.473 | 1.516 |
| 4.75951287018838 | 1.52 | 1.473 | 1.519 |
| 4.76265446284197 | 1.523 | 1.473 | 1.522 |
| 4.765796055495559 | 1.526 | 1.473 | 1.525 |
| 4.768937648149149 | 1.529 | 1.473 | 1.528 |
| 4.772079240802738 | 1.532 | 1.473 | 1.53 |
| 4.775220833456327 | 1.535 | 1.473 | 1.533 |
| 4.778362426109917 | 1.538 | 1.473 | 1.536 |
| 4.781504018763507 | 1.541 | 1.473 | 1.539 |
| 4.784645611417097 | 1.545 | 1.473 | 1.542 |
| 4.787787204070686 | 1.548 | 1.473 | 1.544 |
| 4.790928796724275 | 1.551 | 1.473 | 1.547 |
| 4.794070389377865 | 1.554 | 1.473 | 1.55 |
| 4.797211982031455 | 1.557 | 1.473 | 1.552 |
| 4.800353574685045 | 1.56 | 1.473 | 1.555 |
| 4.803495167338634 | 1.563 | 1.473 | 1.557 |
| 4.806636759992224 | 1.566 | 1.473 | 1.56 |
| 4.809778352645814 | 1.569 | 1.473 | 1.562 |
| 4.812919945299403 | 1.572 | 1.473 | 1.565 |
| 4.816061537952993 | 1.575 | 1.473 | 1.567 |
| 4.819203130606582 | 1.578 | 1.473 | 1.569 |
| 4.822344723260172 | 1.581 | 1.473 | 1.572 |
| 4.825486315913761 | 1.584 | 1.473 | 1.574 |
| 4.828627908567351 | 1.587 | 1.473 | 1.576 |
| 4.83176950122094 | 1.59 | 1.473 | 1.578 |
| 4.83491109387453 | 1.593 | 1.473 | 1.58 |
| 4.83805268652812 | 1.596 | 1.473 | 1.582 |
| 4.841194279181709 | 1.599 | 1.473 | 1.584 |
| 4.844335871835299 | 1.602 | 1.473 | 1.586 |
| 4.847477464488889 | 1.605 | 1.473 | 1.588 |
| 4.850619057142478 | 1.608 | 1.473 | 1.59 |
| 4.853760649796068 | 1.611 | 1.473 | 1.592 |
| 4.856902242449657 | 1.614 | 1.473 | 1.594 |
| 4.860043835103247 | 1.617 | 1.473 | 1.595 |
| 4.863185427756837 | 1.62 | 1.473 | 1.597 |
| 4.866327020410426 | 1.623 | 1.473 | 1.599 |
| 4.869468613064015 | 1.626 | 1.473 | 1.6 |
| 4.872610205717605 | 1.629 | 1.473 | 1.602 |
| 4.875751798371195 | 1.632 | 1.473 | 1.603 |
| 4.878893391024784 | 1.635 | 1.473 | 1.605 |
| 4.882034983678374 | 1.637 | 1.473 | 1.606 |
| 4.885176576331964 | 1.64 | 1.473 | 1.608 |
| 4.888318168985553 | 1.643 | 1.473 | 1.609 |
| 4.891459761639143 | 1.646 | 1.473 | 1.61 |
| 4.894601354292733 | 1.649 | 1.473 | 1.611 |
| 4.897742946946322 | 1.652 | 1.473 | 1.613 |
| 4.900884539599912 | 1.655 | 1.473 | 1.614 |
| 4.904026132253501 | 1.657 | 1.473 | 1.615 |
| 4.907167724907091 | 1.66 | 1.473 | 1.616 |
| 4.91030931756068 | 1.663 | 1.473 | 1.617 |
| 4.91345091021427 | 1.666 | 1.473 | 1.618 |
| 4.91659250286786 | 1.669 | 1.473 | 1.619 |
| 4.91973409552145 | 1.671 | 1.473 | 1.62 |
| 4.922875688175039 | 1.674 | 1.473 | 1.621 |
| 4.926017280828628 | 1.677 | 1.473 | 1.622 |
| 4.929158873482218 | 1.68 | 1.473 | 1.622 |
| 4.932300466135808 | 1.682 | 1.473 | 1.623 |
| 4.935442058789397 | 1.685 | 1.473 | 1.624 |
| 4.938583651442987 | 1.688 | 1.473 | 1.625 |
| 4.941725244096576 | 1.69 | 1.473 | 1.625 |
| 4.944866836750166 | 1.693 | 1.473 | 1.626 |
| 4.948008429403755 | 1.696 | 1.473 | 1.627 |
| 4.951150022057345 | 1.698 | 1.473 | 1.627 |
| 4.954291614710935 | 1.701 | 1.473 | 1.628 |
| 4.957433207364524 | 1.704 | 1.473 | 1.628 |
| 4.960574800018114 | 1.706 | 1.473 | 1.629 |
| 4.963716392671704 | 1.709 | 1.473 | 1.629 |
| 4.966857985325293 | 1.711 | 1.473 | 1.63 |
| 4.969999577978883 | 1.714 | 1.473 | 1.63 |
| 4.973141170632472 | 1.717 | 1.473 | 1.631 |
| 4.976282763286062 | 1.719 | 1.473 | 1.631 |
| 4.979424355939651 | 1.722 | 1.473 | 1.631 |
| 4.982565948593241 | 1.724 | 1.473 | 1.632 |
| 4.985707541246831 | 1.727 | 1.473 | 1.632 |
| 4.98884913390042 | 1.729 | 1.474 | 1.632 |
| 4.99199072655401 | 1.732 | 1.474 | 1.633 |
| 4.9951323192076 | 1.734 | 1.474 | 1.633 |
| 4.99827391186119 | 1.737 | 1.474 | 1.633 |
| 5.00141550451478 | 1.739 | 1.474 | 1.633 |
| 5.004557097168369 | 1.741 | 1.474 | 1.634 |
| 5.007698689821958 | 1.744 | 1.474 | 1.634 |
| 5.010840282475548 | 1.746 | 1.474 | 1.634 |
| 5.013981875129137 | 1.749 | 1.474 | 1.634 |
| 5.017123467782727 | 1.751 | 1.474 | 1.634 |
| 5.020265060436317 | 1.753 | 1.474 | 1.635 |
| 5.023406653089906 | 1.756 | 1.475 | 1.635 |
| 5.026548245743496 | 1.758 | 1.475 | 1.635 |
| 5.029689838397085 | 1.76 | 1.475 | 1.635 |
| 5.032831431050674 | 1.763 | 1.475 | 1.635 |
| 5.035973023704264 | 1.765 | 1.475 | 1.635 |
| 5.039114616357854 | 1.767 | 1.475 | 1.635 |
| 5.042256209011444 | 1.77 | 1.475 | 1.635 |
| 5.045397801665033 | 1.772 | 1.476 | 1.636 |
| 5.048539394318622 | 1.774 | 1.476 | 1.636 |
| 5.051680986972213 | 1.776 | 1.476 | 1.636 |
| 5.054822579625802 | 1.778 | 1.476 | 1.636 |
| 5.057964172279392 | 1.781 | 1.476 | 1.636 |
| 5.061105764932981 | 1.783 | 1.477 | 1.636 |
| 5.064247357586571 | 1.785 | 1.477 | 1.636 |
| 5.067388950240161 | 1.787 | 1.477 | 1.636 |
| 5.07053054289375 | 1.789 | 1.477 | 1.636 |
| 5.07367213554734 | 1.791 | 1.478 | 1.636 |
| 5.07681372820093 | 1.793 | 1.478 | 1.636 |
| 5.079955320854519 | 1.796 | 1.478 | 1.636 |
| 5.083096913508108 | 1.798 | 1.478 | 1.636 |
| 5.086238506161698 | 1.8 | 1.479 | 1.636 |
| 5.089380098815288 | 1.802 | 1.479 | 1.636 |
| 5.092521691468877 | 1.804 | 1.479 | 1.636 |
| 5.095663284122466 | 1.806 | 1.48 | 1.636 |
| 5.098804876776057 | 1.808 | 1.48 | 1.636 |
| 5.101946469429646 | 1.81 | 1.48 | 1.636 |
| 5.105088062083236 | 1.812 | 1.481 | 1.636 |
| 5.108229654736825 | 1.814 | 1.481 | 1.636 |
| 5.111371247390415 | 1.816 | 1.482 | 1.636 |
| 5.114512840044005 | 1.817 | 1.482 | 1.636 |
| 5.117654432697594 | 1.819 | 1.482 | 1.636 |
| 5.120796025351184 | 1.821 | 1.483 | 1.636 |
| 5.123937618004773 | 1.823 | 1.483 | 1.636 |
| 5.127079210658363 | 1.825 | 1.484 | 1.636 |
| 5.130220803311953 | 1.827 | 1.484 | 1.636 |
| 5.133362395965542 | 1.829 | 1.485 | 1.636 |
| 5.136503988619131 | 1.83 | 1.485 | 1.636 |
| 5.13964558127272 | 1.832 | 1.486 | 1.636 |
| 5.142787173926311 | 1.834 | 1.487 | 1.636 |
| 5.1459287665799 | 1.836 | 1.487 | 1.636 |
| 5.14907035923349 | 1.837 | 1.488 | 1.636 |
| 5.15221195188708 | 1.839 | 1.489 | 1.636 |
| 5.15535354454067 | 1.841 | 1.489 | 1.636 |
| 5.158495137194259 | 1.843 | 1.49 | 1.636 |
| 5.161636729847848 | 1.844 | 1.491 | 1.636 |
| 5.164778322501438 | 1.846 | 1.491 | 1.636 |
| 5.167919915155028 | 1.848 | 1.492 | 1.636 |
| 5.171061507808617 | 1.849 | 1.493 | 1.636 |
| 5.174203100462206 | 1.851 | 1.494 | 1.636 |
| 5.177344693115796 | 1.853 | 1.494 | 1.636 |
| 5.180486285769386 | 1.854 | 1.495 | 1.636 |
| 5.183627878422976 | 1.856 | 1.496 | 1.636 |
| 5.186769471076565 | 1.857 | 1.497 | 1.636 |
| 5.189911063730155 | 1.859 | 1.498 | 1.636 |
| 5.193052656383744 | 1.86 | 1.499 | 1.636 |
| 5.196194249037334 | 1.862 | 1.5 | 1.636 |
| 5.199335841690924 | 1.863 | 1.501 | 1.636 |
| 5.202477434344513 | 1.865 | 1.502 | 1.636 |
| 5.205619026998103 | 1.866 | 1.503 | 1.636 |
| 5.208760619651692 | 1.868 | 1.504 | 1.636 |
| 5.211902212305282 | 1.869 | 1.505 | 1.636 |
| 5.215043804958871 | 1.871 | 1.506 | 1.636 |
| 5.218185397612461 | 1.872 | 1.507 | 1.636 |
| 5.221326990266051 | 1.873 | 1.509 | 1.636 |
| 5.22446858291964 | 1.875 | 1.51 | 1.636 |
| 5.22761017557323 | 1.876 | 1.511 | 1.636 |
| 5.23075176822682 | 1.878 | 1.512 | 1.636 |
| 5.23389336088041 | 1.879 | 1.514 | 1.636 |
| 5.237034953533999 | 1.88 | 1.515 | 1.636 |
| 5.240176546187588 | 1.882 | 1.516 | 1.636 |
| 5.243318138841178 | 1.883 | 1.518 | 1.636 |
| 5.246459731494767 | 1.884 | 1.519 | 1.636 |
| 5.249601324148357 | 1.885 | 1.52 | 1.636 |
| 5.252742916801947 | 1.887 | 1.522 | 1.636 |
| 5.255884509455536 | 1.888 | 1.523 | 1.636 |
| 5.259026102109125 | 1.889 | 1.525 | 1.636 |
| 5.262167694762715 | 1.89 | 1.527 | 1.636 |
| 5.265309287416305 | 1.892 | 1.528 | 1.636 |
| 5.268450880069895 | 1.893 | 1.53 | 1.636 |
| 5.271592472723484 | 1.894 | 1.531 | 1.636 |
| 5.274734065377074 | 1.895 | 1.533 | 1.636 |
| 5.277875658030664 | 1.896 | 1.535 | 1.636 |
| 5.281017250684253 | 1.897 | 1.537 | 1.636 |
| 5.284158843337843 | 1.898 | 1.538 | 1.636 |
| 5.287300435991432 | 1.9 | 1.54 | 1.636 |
| 5.290442028645022 | 1.901 | 1.542 | 1.636 |
| 5.293583621298612 | 1.902 | 1.544 | 1.636 |
| 5.296725213952201 | 1.903 | 1.546 | 1.636 |
| 5.299866806605791 | 1.904 | 1.548 | 1.636 |
| 5.30300839925938 | 1.905 | 1.55 | 1.636 |
| 5.30614999191297 | 1.906 | 1.552 | 1.636 |
| 5.30929158456656 | 1.907 | 1.554 | 1.636 |
| 5.312433177220149 | 1.908 | 1.556 | 1.636 |
| 5.315574769873739 | 1.909 | 1.558 | 1.636 |
| 5.318716362527328 | 1.91 | 1.56 | 1.636 |
| 5.321857955180918 | 1.911 | 1.562 | 1.636 |
| 5.324999547834508 | 1.912 | 1.564 | 1.636 |
| 5.328141140488097 | 1.913 | 1.566 | 1.636 |
| 5.331282733141686 | 1.914 | 1.568 | 1.636 |
| 5.334424325795276 | 1.915 | 1.571 | 1.636 |
| 5.337565918448866 | 1.915 | 1.573 | 1.636 |
| 5.340707511102456 | 1.916 | 1.575 | 1.636 |
| 5.343849103756045 | 1.917 | 1.578 | 1.636 |
| 5.346990696409634 | 1.918 | 1.58 | 1.636 |
| 5.350132289063224 | 1.919 | 1.582 | 1.636 |
| 5.353273881716814 | 1.92 | 1.585 | 1.636 |
| 5.356415474370403 | 1.921 | 1.587 | 1.636 |
| 5.359557067023993 | 1.921 | 1.59 | 1.636 |
| 5.362698659677583 | 1.922 | 1.592 | 1.636 |
| 5.365840252331172 | 1.923 | 1.595 | 1.636 |
| 5.368981844984762 | 1.924 | 1.597 | 1.636 |
| 5.372123437638351 | 1.925 | 1.6 | 1.636 |
| 5.375265030291941 | 1.925 | 1.603 | 1.636 |
| 5.378406622945531 | 1.926 | 1.605 | 1.636 |
| 5.38154821559912 | 1.927 | 1.608 | 1.636 |
| 5.38468980825271 | 1.928 | 1.611 | 1.636 |
| 5.387831400906299 | 1.928 | 1.613 | 1.636 |
| 5.39097299355989 | 1.929 | 1.616 | 1.636 |
| 5.394114586213479 | 1.93 | 1.619 | 1.636 |
| 5.397256178867068 | 1.93 | 1.621 | 1.636 |
| 5.400397771520657 | 1.931 | 1.624 | 1.637 |
| 5.403539364174247 | 1.932 | 1.627 | 1.637 |
| 5.406680956827837 | 1.932 | 1.63 | 1.637 |
| 5.409822549481426 | 1.933 | 1.633 | 1.637 |
| 5.412964142135016 | 1.934 | 1.636 | 1.637 |
| 5.416105734788605 | 1.934 | 1.639 | 1.637 |
| 5.419247327442195 | 1.935 | 1.641 | 1.637 |
| 5.422388920095785 | 1.935 | 1.644 | 1.637 |
| 5.425530512749375 | 1.936 | 1.647 | 1.637 |
| 5.428672105402964 | 1.937 | 1.65 | 1.637 |
| 5.431813698056554 | 1.937 | 1.653 | 1.637 |
| 5.434955290710143 | 1.938 | 1.656 | 1.637 |
| 5.438096883363733 | 1.938 | 1.659 | 1.637 |
| 5.441238476017322 | 1.939 | 1.662 | 1.637 |
| 5.444380068670912 | 1.939 | 1.665 | 1.638 |
| 5.447521661324502 | 1.94 | 1.668 | 1.638 |
| 5.450663253978091 | 1.94 | 1.671 | 1.638 |
| 5.453804846631681 | 1.941 | 1.674 | 1.638 |
| 5.456946439285271 | 1.941 | 1.677 | 1.638 |
| 5.46008803193886 | 1.942 | 1.681 | 1.638 |
| 5.46322962459245 | 1.942 | 1.684 | 1.639 |
| 5.466371217246039 | 1.943 | 1.687 | 1.639 |
| 5.46951280989963 | 1.943 | 1.69 | 1.639 |
| 5.472654402553218 | 1.944 | 1.693 | 1.639 |
| 5.475795995206808 | 1.944 | 1.696 | 1.639 |
| 5.478937587860398 | 1.945 | 1.699 | 1.64 |
| 5.482079180513987 | 1.945 | 1.702 | 1.64 |
| 5.485220773167577 | 1.946 | 1.706 | 1.64 |
| 5.488362365821166 | 1.946 | 1.709 | 1.641 |
| 5.491503958474756 | 1.946 | 1.712 | 1.641 |
| 5.494645551128346 | 1.947 | 1.715 | 1.641 |
| 5.497787143781935 | 1.947 | 1.718 | 1.642 |
| 5.500928736435525 | 1.948 | 1.721 | 1.642 |
| 5.504070329089115 | 1.948 | 1.724 | 1.643 |
| 5.507211921742704 | 1.948 | 1.727 | 1.643 |
| 5.510353514396294 | 1.949 | 1.731 | 1.643 |
| 5.513495107049883 | 1.949 | 1.734 | 1.644 |
| 5.516636699703473 | 1.949 | 1.737 | 1.644 |
| 5.519778292357062 | 1.95 | 1.74 | 1.645 |
| 5.522919885010652 | 1.95 | 1.743 | 1.646 |
| 5.526061477664242 | 1.95 | 1.746 | 1.646 |
| 5.529203070317831 | 1.951 | 1.749 | 1.647 |
| 5.532344662971421 | 1.951 | 1.752 | 1.648 |
| 5.535486255625011 | 1.951 | 1.756 | 1.648 |
| 5.5386278482786 | 1.952 | 1.759 | 1.649 |
| 5.54176944093219 | 1.952 | 1.762 | 1.65 |
| 5.544911033585779 | 1.952 | 1.765 | 1.651 |
| 5.54805262623937 | 1.953 | 1.768 | 1.651 |
| 5.551194218892959 | 1.953 | 1.771 | 1.652 |
| 5.554335811546548 | 1.953 | 1.774 | 1.653 |
| 5.557477404200137 | 1.953 | 1.777 | 1.654 |
| 5.560618996853727 | 1.954 | 1.78 | 1.655 |
| 5.563760589507317 | 1.954 | 1.783 | 1.656 |
| 5.566902182160906 | 1.954 | 1.786 | 1.657 |
| 5.570043774814496 | 1.954 | 1.789 | 1.658 |
| 5.573185367468086 | 1.955 | 1.792 | 1.659 |
| 5.576326960121675 | 1.955 | 1.795 | 1.661 |
| 5.579468552775264 | 1.955 | 1.798 | 1.662 |
| 5.582610145428854 | 1.955 | 1.8 | 1.663 |
| 5.585751738082444 | 1.956 | 1.803 | 1.664 |
| 5.588893330736034 | 1.956 | 1.806 | 1.666 |
| 5.592034923389623 | 1.956 | 1.809 | 1.667 |
| 5.595176516043213 | 1.956 | 1.812 | 1.669 |
| 5.598318108696803 | 1.956 | 1.815 | 1.67 |
| 5.601459701350392 | 1.957 | 1.817 | 1.672 |
| 5.604601294003982 | 1.957 | 1.82 | 1.673 |
| 5.607742886657571 | 1.957 | 1.823 | 1.675 |
| 5.610884479311161 | 1.957 | 1.826 | 1.677 |
| 5.61402607196475 | 1.957 | 1.828 | 1.678 |
| 5.61716766461834 | 1.958 | 1.831 | 1.68 |
| 5.62030925727193 | 1.958 | 1.834 | 1.682 |
| 5.623450849925519 | 1.958 | 1.836 | 1.684 |
| 5.626592442579109 | 1.958 | 1.839 | 1.686 |
| 5.629734035232698 | 1.958 | 1.841 | 1.688 |
| 5.632875627886288 | 1.958 | 1.844 | 1.69 |
| 5.636017220539878 | 1.959 | 1.846 | 1.692 |
| 5.639158813193467 | 1.959 | 1.849 | 1.694 |
| 5.642300405847057 | 1.959 | 1.851 | 1.696 |
| 5.645441998500646 | 1.959 | 1.854 | 1.698 |
| 5.648583591154236 | 1.959 | 1.856 | 1.7 |
| 5.651725183807825 | 1.959 | 1.858 | 1.702 |
| 5.654866776461415 | 1.959 | 1.861 | 1.705 |
| 5.658008369115005 | 1.96 | 1.863 | 1.707 |
| 5.661149961768594 | 1.96 | 1.865 | 1.709 |
| 5.664291554422184 | 1.96 | 1.868 | 1.712 |
| 5.667433147075774 | 1.96 | 1.87 | 1.714 |
| 5.670574739729363 | 1.96 | 1.872 | 1.717 |
| 5.673716332382953 | 1.96 | 1.874 | 1.719 |
| 5.676857925036542 | 1.96 | 1.876 | 1.722 |
| 5.679999517690132 | 1.96 | 1.878 | 1.725 |
| 5.683141110343721 | 1.96 | 1.881 | 1.727 |
| 5.686282702997311 | 1.961 | 1.883 | 1.73 |
| 5.689424295650901 | 1.961 | 1.885 | 1.733 |
| 5.69256588830449 | 1.961 | 1.887 | 1.735 |
| 5.69570748095808 | 1.961 | 1.889 | 1.738 |
| 5.69884907361167 | 1.961 | 1.89 | 1.741 |
| 5.701990666265259 | 1.961 | 1.892 | 1.744 |
| 5.705132258918849 | 1.961 | 1.894 | 1.747 |
| 5.708273851572438 | 1.961 | 1.896 | 1.75 |
| 5.711415444226028 | 1.961 | 1.898 | 1.753 |
| 5.714557036879618 | 1.961 | 1.9 | 1.756 |
| 5.717698629533207 | 1.961 | 1.901 | 1.759 |
| 5.720840222186797 | 1.962 | 1.903 | 1.762 |
| 5.723981814840386 | 1.962 | 1.905 | 1.765 |
| 5.727123407493976 | 1.962 | 1.906 | 1.768 |
| 5.730265000147565 | 1.962 | 1.908 | 1.771 |
| 5.733406592801155 | 1.962 | 1.91 | 1.774 |
| 5.736548185454744 | 1.962 | 1.911 | 1.777 |
| 5.739689778108334 | 1.962 | 1.913 | 1.78 |
| 5.742831370761924 | 1.962 | 1.914 | 1.783 |
| 5.745972963415514 | 1.962 | 1.916 | 1.786 |
| 5.749114556069103 | 1.962 | 1.917 | 1.789 |
| 5.752256148722693 | 1.962 | 1.918 | 1.793 |
| 5.755397741376282 | 1.962 | 1.92 | 1.796 |
| 5.758539334029872 | 1.962 | 1.921 | 1.799 |
| 5.761680926683462 | 1.962 | 1.923 | 1.802 |
| 5.764822519337051 | 1.962 | 1.924 | 1.805 |
| 5.767964111990641 | 1.962 | 1.925 | 1.808 |
| 5.77110570464423 | 1.962 | 1.926 | 1.811 |
| 5.77424729729782 | 1.962 | 1.928 | 1.815 |
| 5.77738888995141 | 1.963 | 1.929 | 1.818 |
| 5.780530482605 | 1.963 | 1.93 | 1.821 |
| 5.783672075258588 | 1.963 | 1.931 | 1.824 |
| 5.786813667912178 | 1.963 | 1.932 | 1.827 |
| 5.789955260565768 | 1.963 | 1.933 | 1.83 |
| 5.793096853219358 | 1.963 | 1.934 | 1.833 |
| 5.796238445872947 | 1.963 | 1.935 | 1.836 |
| 5.799380038526537 | 1.963 | 1.936 | 1.839 |
| 5.802521631180126 | 1.963 | 1.937 | 1.842 |
| 5.805663223833715 | 1.963 | 1.938 | 1.845 |
| 5.808804816487306 | 1.963 | 1.939 | 1.848 |
| 5.811946409140895 | 1.963 | 1.94 | 1.851 |
| 5.815088001794485 | 1.963 | 1.941 | 1.854 |
| 5.818229594448074 | 1.963 | 1.942 | 1.857 |
| 5.821371187101663 | 1.963 | 1.942 | 1.86 |
| 5.824512779755254 | 1.963 | 1.943 | 1.862 |
| 5.827654372408843 | 1.963 | 1.944 | 1.865 |
| 5.830795965062433 | 1.963 | 1.945 | 1.868 |
| 5.833937557716022 | 1.963 | 1.946 | 1.871 |
| 5.837079150369612 | 1.963 | 1.946 | 1.873 |
| 5.840220743023201 | 1.963 | 1.947 | 1.876 |
| 5.843362335676791 | 1.963 | 1.948 | 1.879 |
| 5.846503928330381 | 1.963 | 1.948 | 1.881 |
| 5.84964552098397 | 1.963 | 1.949 | 1.884 |
| 5.85278711363756 | 1.963 | 1.949 | 1.886 |
| 5.85592870629115 | 1.963 | 1.95 | 1.889 |
| 5.85907029894474 | 1.963 | 1.951 | 1.891 |
| 5.862211891598329 | 1.963 | 1.951 | 1.893 |
| 5.865353484251918 | 1.963 | 1.952 | 1.896 |
| 5.868495076905508 | 1.963 | 1.952 | 1.898 |
| 5.871636669559098 | 1.963 | 1.953 | 1.9 |
| 5.874778262212687 | 1.963 | 1.953 | 1.903 |
| 5.877919854866277 | 1.963 | 1.954 | 1.905 |
| 5.881061447519866 | 1.963 | 1.954 | 1.907 |
| 5.884203040173456 | 1.963 | 1.955 | 1.909 |
| 5.887344632827046 | 1.963 | 1.955 | 1.911 |
| 5.890486225480635 | 1.963 | 1.955 | 1.913 |
| 5.893627818134224 | 1.963 | 1.956 | 1.915 |
| 5.896769410787814 | 1.963 | 1.956 | 1.917 |
| 5.899911003441404 | 1.963 | 1.956 | 1.919 |
| 5.903052596094994 | 1.963 | 1.957 | 1.92 |
| 5.906194188748583 | 1.963 | 1.957 | 1.922 |
| 5.909335781402172 | 1.963 | 1.957 | 1.924 |
| 5.912477374055762 | 1.963 | 1.958 | 1.925 |
| 5.915618966709352 | 1.963 | 1.958 | 1.927 |
| 5.918760559362942 | 1.963 | 1.958 | 1.929 |
| 5.921902152016531 | 1.963 | 1.959 | 1.93 |
| 5.92504374467012 | 1.963 | 1.959 | 1.932 |
| 5.92818533732371 | 1.963 | 1.959 | 1.933 |
| 5.9313269299773 | 1.963 | 1.959 | 1.934 |
| 5.93446852263089 | 1.963 | 1.96 | 1.936 |
| 5.93761011528448 | 1.963 | 1.96 | 1.937 |
| 5.940751707938068 | 1.963 | 1.96 | 1.938 |
| 5.943893300591658 | 1.963 | 1.96 | 1.94 |
| 5.947034893245248 | 1.963 | 1.96 | 1.941 |
| 5.950176485898837 | 1.963 | 1.961 | 1.942 |
| 5.953318078552427 | 1.963 | 1.961 | 1.943 |
| 5.956459671206017 | 1.963 | 1.961 | 1.944 |
| 5.959601263859606 | 1.963 | 1.961 | 1.945 |
| 5.962742856513196 | 1.963 | 1.961 | 1.946 |
| 5.965884449166785 | 1.963 | 1.961 | 1.947 |
| 5.969026041820375 | 1.963 | 1.961 | 1.948 |
| 5.972167634473964 | 1.963 | 1.962 | 1.949 |
| 5.975309227127554 | 1.963 | 1.962 | 1.949 |
| 5.978450819781144 | 1.963 | 1.962 | 1.95 |
| 5.981592412434733 | 1.963 | 1.962 | 1.951 |
| 5.984734005088323 | 1.963 | 1.962 | 1.952 |
| 5.987875597741913 | 1.963 | 1.962 | 1.952 |
| 5.991017190395502 | 1.963 | 1.962 | 1.953 |
| 5.994158783049092 | 1.963 | 1.962 | 1.954 |
| 5.997300375702681 | 1.963 | 1.962 | 1.954 |
| 6.000441968356271 | 1.963 | 1.962 | 1.955 |
| 6.003583561009861 | 1.963 | 1.963 | 1.955 |
| 6.00672515366345 | 1.963 | 1.963 | 1.956 |
| 6.00986674631704 | 1.963 | 1.963 | 1.956 |
| 6.01300833897063 | 1.963 | 1.963 | 1.957 |
| 6.01614993162422 | 1.963 | 1.963 | 1.957 |
| 6.019291524277808 | 1.963 | 1.963 | 1.958 |
| 6.022433116931398 | 1.963 | 1.963 | 1.958 |
| 6.025574709584988 | 1.963 | 1.963 | 1.959 |
| 6.028716302238577 | 1.963 | 1.963 | 1.959 |
| 6.031857894892167 | 1.963 | 1.963 | 1.959 |
| 6.034999487545757 | 1.963 | 1.963 | 1.96 |
| 6.038141080199346 | 1.963 | 1.963 | 1.96 |
| 6.041282672852935 | 1.963 | 1.963 | 1.96 |
| 6.044424265506525 | 1.963 | 1.963 | 1.96 |
| 6.047565858160115 | 1.963 | 1.963 | 1.961 |
| 6.050707450813704 | 1.963 | 1.963 | 1.961 |
| 6.053849043467294 | 1.963 | 1.963 | 1.961 |
| 6.056990636120884 | 1.963 | 1.963 | 1.961 |
| 6.060132228774473 | 1.963 | 1.963 | 1.961 |
| 6.063273821428063 | 1.963 | 1.963 | 1.962 |
| 6.066415414081653 | 1.963 | 1.963 | 1.962 |
| 6.069557006735242 | 1.963 | 1.963 | 1.962 |
| 6.072698599388831 | 1.963 | 1.963 | 1.962 |
| 6.07584019204242 | 1.963 | 1.963 | 1.962 |
| 6.078981784696011 | 1.963 | 1.963 | 1.962 |
| 6.082123377349601 | 1.963 | 1.963 | 1.962 |
| 6.08526497000319 | 1.963 | 1.963 | 1.963 |
| 6.08840656265678 | 1.963 | 1.963 | 1.963 |
| 6.09154815531037 | 1.963 | 1.963 | 1.963 |
| 6.094689747963959 | 1.963 | 1.963 | 1.963 |
| 6.097831340617549 | 1.963 | 1.963 | 1.963 |
| 6.100972933271138 | 1.963 | 1.963 | 1.963 |
| 6.104114525924728 | 1.963 | 1.963 | 1.963 |
| 6.107256118578317 | 1.963 | 1.963 | 1.963 |
| 6.110397711231907 | 1.963 | 1.963 | 1.963 |
| 6.113539303885497 | 1.963 | 1.963 | 1.963 |
| 6.116680896539086 | 1.963 | 1.963 | 1.963 |
| 6.119822489192675 | 1.963 | 1.963 | 1.963 |
| 6.122964081846265 | 1.963 | 1.963 | 1.963 |
| 6.126105674499855 | 1.963 | 1.963 | 1.963 |
| 6.129247267153445 | 1.963 | 1.963 | 1.963 |
| 6.132388859807034 | 1.963 | 1.963 | 1.963 |
| 6.135530452460624 | 1.963 | 1.963 | 1.963 |
| 6.138672045114213 | 1.963 | 1.963 | 1.963 |
| 6.141813637767803 | 1.963 | 1.963 | 1.963 |
| 6.144955230421393 | 1.963 | 1.963 | 1.963 |
| 6.148096823074982 | 1.963 | 1.963 | 1.963 |
| 6.151238415728571 | 1.963 | 1.963 | 1.963 |
| 6.154380008382161 | 1.963 | 1.963 | 1.963 |
| 6.157521601035751 | 1.963 | 1.963 | 1.963 |
| 6.16066319368934 | 1.963 | 1.963 | 1.963 |
| 6.16380478634293 | 1.963 | 1.963 | 1.963 |
| 6.16694637899652 | 1.963 | 1.963 | 1.963 |
| 6.170087971650109 | 1.963 | 1.963 | 1.963 |
| 6.173229564303698 | 1.963 | 1.963 | 1.963 |
| 6.176371156957289 | 1.963 | 1.963 | 1.963 |
| 6.179512749610878 | 1.963 | 1.963 | 1.963 |
| 6.182654342264468 | 1.963 | 1.963 | 1.963 |
| 6.185795934918057 | 1.963 | 1.963 | 1.963 |
| 6.188937527571647 | 1.963 | 1.963 | 1.963 |
| 6.192079120225237 | 1.963 | 1.963 | 1.963 |
| 6.195220712878826 | 1.963 | 1.963 | 1.963 |
| 6.198362305532415 | 1.963 | 1.963 | 1.963 |
| 6.201503898186005 | 1.963 | 1.963 | 1.963 |
| 6.204645490839594 | 1.963 | 1.963 | 1.963 |
| 6.207787083493184 | 1.963 | 1.963 | 1.963 |
| 6.210928676146774 | 1.963 | 1.963 | 1.963 |
| 6.214070268800364 | 1.963 | 1.963 | 1.963 |
| 6.217211861453953 | 1.963 | 1.963 | 1.963 |
| 6.220353454107543 | 1.963 | 1.963 | 1.963 |
| 6.223495046761133 | 1.963 | 1.963 | 1.963 |
| 6.226636639414722 | 1.963 | 1.963 | 1.963 |
| 6.229778232068312 | 1.963 | 1.963 | 1.963 |
| 6.232919824721901 | 1.963 | 1.963 | 1.963 |
| 6.236061417375491 | 1.963 | 1.963 | 1.963 |
| 6.23920301002908 | 1.963 | 1.963 | 1.963 |
| 6.24234460268267 | 1.963 | 1.963 | 1.963 |
| 6.24548619533626 | 1.963 | 1.963 | 1.963 |
| 6.24862778798985 | 1.963 | 1.963 | 1.963 |
| 6.251769380643438 | 1.963 | 1.963 | 1.963 |
| 6.254910973297028 | 1.963 | 1.963 | 1.963 |
| 6.258052565950618 | 1.963 | 1.963 | 1.963 |
| 6.261194158604208 | 1.963 | 1.963 | 1.963 |
| 6.264335751257797 | 1.963 | 1.963 | 1.963 |
| 6.267477343911387 | 1.963 | 1.963 | 1.963 |
| 6.270618936564976 | 1.963 | 1.963 | 1.963 |
| 6.273760529218566 | 1.963 | 1.963 | 1.963 |
| 6.276902121872155 | 1.963 | 1.963 | 1.963 |
| 6.280043714525745 | 1.963 | 1.963 | 1.963 |
| 6.283185307179335 | 1.963 | 1.963 | 1.963 |